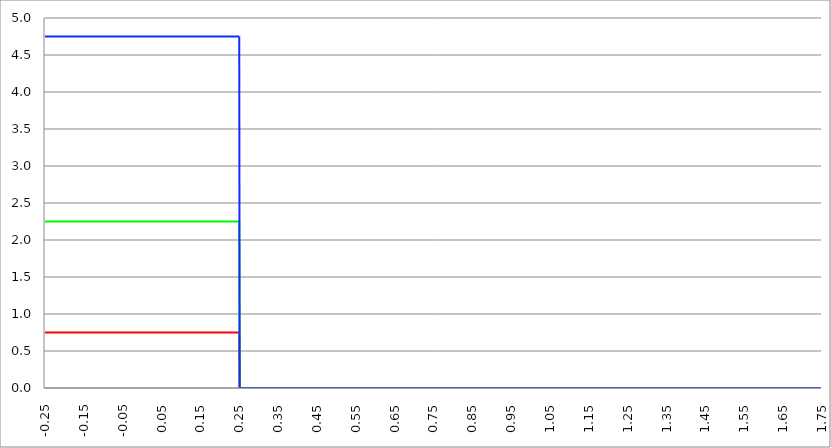
| Category | Series 1 | Series 0 | Series 2 |
|---|---|---|---|
| -0.25 | 0.75 | 2.25 | 4.75 |
| -0.249 | 0.75 | 2.25 | 4.75 |
| -0.248 | 0.75 | 2.25 | 4.75 |
| -0.247 | 0.75 | 2.25 | 4.75 |
| -0.246 | 0.75 | 2.25 | 4.75 |
| -0.245 | 0.75 | 2.25 | 4.75 |
| -0.244 | 0.75 | 2.25 | 4.75 |
| -0.243 | 0.75 | 2.25 | 4.75 |
| -0.242 | 0.75 | 2.25 | 4.75 |
| -0.241 | 0.75 | 2.25 | 4.75 |
| -0.24 | 0.75 | 2.25 | 4.75 |
| -0.239 | 0.75 | 2.25 | 4.75 |
| -0.238 | 0.75 | 2.25 | 4.75 |
| -0.237 | 0.75 | 2.25 | 4.75 |
| -0.236 | 0.75 | 2.25 | 4.75 |
| -0.235 | 0.75 | 2.25 | 4.75 |
| -0.234 | 0.75 | 2.25 | 4.75 |
| -0.233 | 0.75 | 2.25 | 4.75 |
| -0.232 | 0.75 | 2.25 | 4.75 |
| -0.231 | 0.75 | 2.25 | 4.75 |
| -0.23 | 0.75 | 2.25 | 4.75 |
| -0.229 | 0.75 | 2.25 | 4.75 |
| -0.228 | 0.75 | 2.25 | 4.75 |
| -0.227 | 0.75 | 2.25 | 4.75 |
| -0.226 | 0.75 | 2.25 | 4.75 |
| -0.225 | 0.75 | 2.25 | 4.75 |
| -0.224 | 0.75 | 2.25 | 4.75 |
| -0.223 | 0.75 | 2.25 | 4.75 |
| -0.222 | 0.75 | 2.25 | 4.75 |
| -0.221 | 0.75 | 2.25 | 4.75 |
| -0.22 | 0.75 | 2.25 | 4.75 |
| -0.219 | 0.75 | 2.25 | 4.75 |
| -0.218 | 0.75 | 2.25 | 4.75 |
| -0.217 | 0.75 | 2.25 | 4.75 |
| -0.216 | 0.75 | 2.25 | 4.75 |
| -0.215 | 0.75 | 2.25 | 4.75 |
| -0.214 | 0.75 | 2.25 | 4.75 |
| -0.213 | 0.75 | 2.25 | 4.75 |
| -0.212 | 0.75 | 2.25 | 4.75 |
| -0.211 | 0.75 | 2.25 | 4.75 |
| -0.21 | 0.75 | 2.25 | 4.75 |
| -0.209 | 0.75 | 2.25 | 4.75 |
| -0.208 | 0.75 | 2.25 | 4.75 |
| -0.207 | 0.75 | 2.25 | 4.75 |
| -0.206 | 0.75 | 2.25 | 4.75 |
| -0.205 | 0.75 | 2.25 | 4.75 |
| -0.204 | 0.75 | 2.25 | 4.75 |
| -0.203 | 0.75 | 2.25 | 4.75 |
| -0.202 | 0.75 | 2.25 | 4.75 |
| -0.201 | 0.75 | 2.25 | 4.75 |
| -0.2 | 0.75 | 2.25 | 4.75 |
| -0.199 | 0.75 | 2.25 | 4.75 |
| -0.198 | 0.75 | 2.25 | 4.75 |
| -0.197 | 0.75 | 2.25 | 4.75 |
| -0.196 | 0.75 | 2.25 | 4.75 |
| -0.195 | 0.75 | 2.25 | 4.75 |
| -0.194 | 0.75 | 2.25 | 4.75 |
| -0.193 | 0.75 | 2.25 | 4.75 |
| -0.192 | 0.75 | 2.25 | 4.75 |
| -0.191 | 0.75 | 2.25 | 4.75 |
| -0.19 | 0.75 | 2.25 | 4.75 |
| -0.189 | 0.75 | 2.25 | 4.75 |
| -0.188 | 0.75 | 2.25 | 4.75 |
| -0.187 | 0.75 | 2.25 | 4.75 |
| -0.186 | 0.75 | 2.25 | 4.75 |
| -0.185 | 0.75 | 2.25 | 4.75 |
| -0.184 | 0.75 | 2.25 | 4.75 |
| -0.183 | 0.75 | 2.25 | 4.75 |
| -0.182 | 0.75 | 2.25 | 4.75 |
| -0.181 | 0.75 | 2.25 | 4.75 |
| -0.18 | 0.75 | 2.25 | 4.75 |
| -0.179 | 0.75 | 2.25 | 4.75 |
| -0.178 | 0.75 | 2.25 | 4.75 |
| -0.177 | 0.75 | 2.25 | 4.75 |
| -0.176 | 0.75 | 2.25 | 4.75 |
| -0.175 | 0.75 | 2.25 | 4.75 |
| -0.174 | 0.75 | 2.25 | 4.75 |
| -0.173 | 0.75 | 2.25 | 4.75 |
| -0.172 | 0.75 | 2.25 | 4.75 |
| -0.171 | 0.75 | 2.25 | 4.75 |
| -0.17 | 0.75 | 2.25 | 4.75 |
| -0.169 | 0.75 | 2.25 | 4.75 |
| -0.168 | 0.75 | 2.25 | 4.75 |
| -0.167 | 0.75 | 2.25 | 4.75 |
| -0.166 | 0.75 | 2.25 | 4.75 |
| -0.165 | 0.75 | 2.25 | 4.75 |
| -0.164 | 0.75 | 2.25 | 4.75 |
| -0.163 | 0.75 | 2.25 | 4.75 |
| -0.162 | 0.75 | 2.25 | 4.75 |
| -0.161 | 0.75 | 2.25 | 4.75 |
| -0.16 | 0.75 | 2.25 | 4.75 |
| -0.159 | 0.75 | 2.25 | 4.75 |
| -0.158 | 0.75 | 2.25 | 4.75 |
| -0.157 | 0.75 | 2.25 | 4.75 |
| -0.156 | 0.75 | 2.25 | 4.75 |
| -0.155 | 0.75 | 2.25 | 4.75 |
| -0.154 | 0.75 | 2.25 | 4.75 |
| -0.153 | 0.75 | 2.25 | 4.75 |
| -0.152 | 0.75 | 2.25 | 4.75 |
| -0.151 | 0.75 | 2.25 | 4.75 |
| -0.15 | 0.75 | 2.25 | 4.75 |
| -0.149 | 0.75 | 2.25 | 4.75 |
| -0.148 | 0.75 | 2.25 | 4.75 |
| -0.147 | 0.75 | 2.25 | 4.75 |
| -0.146 | 0.75 | 2.25 | 4.75 |
| -0.145 | 0.75 | 2.25 | 4.75 |
| -0.144 | 0.75 | 2.25 | 4.75 |
| -0.143 | 0.75 | 2.25 | 4.75 |
| -0.142 | 0.75 | 2.25 | 4.75 |
| -0.141 | 0.75 | 2.25 | 4.75 |
| -0.14 | 0.75 | 2.25 | 4.75 |
| -0.139 | 0.75 | 2.25 | 4.75 |
| -0.138 | 0.75 | 2.25 | 4.75 |
| -0.137 | 0.75 | 2.25 | 4.75 |
| -0.136 | 0.75 | 2.25 | 4.75 |
| -0.135 | 0.75 | 2.25 | 4.75 |
| -0.134 | 0.75 | 2.25 | 4.75 |
| -0.133 | 0.75 | 2.25 | 4.75 |
| -0.132 | 0.75 | 2.25 | 4.75 |
| -0.131 | 0.75 | 2.25 | 4.75 |
| -0.13 | 0.75 | 2.25 | 4.75 |
| -0.129 | 0.75 | 2.25 | 4.75 |
| -0.128 | 0.75 | 2.25 | 4.75 |
| -0.127 | 0.75 | 2.25 | 4.75 |
| -0.126 | 0.75 | 2.25 | 4.75 |
| -0.125 | 0.75 | 2.25 | 4.75 |
| -0.124 | 0.75 | 2.25 | 4.75 |
| -0.123 | 0.75 | 2.25 | 4.75 |
| -0.122 | 0.75 | 2.25 | 4.75 |
| -0.121 | 0.75 | 2.25 | 4.75 |
| -0.12 | 0.75 | 2.25 | 4.75 |
| -0.119 | 0.75 | 2.25 | 4.75 |
| -0.118 | 0.75 | 2.25 | 4.75 |
| -0.117 | 0.75 | 2.25 | 4.75 |
| -0.116 | 0.75 | 2.25 | 4.75 |
| -0.115 | 0.75 | 2.25 | 4.75 |
| -0.114 | 0.75 | 2.25 | 4.75 |
| -0.113 | 0.75 | 2.25 | 4.75 |
| -0.112 | 0.75 | 2.25 | 4.75 |
| -0.111 | 0.75 | 2.25 | 4.75 |
| -0.11 | 0.75 | 2.25 | 4.75 |
| -0.109 | 0.75 | 2.25 | 4.75 |
| -0.108 | 0.75 | 2.25 | 4.75 |
| -0.107 | 0.75 | 2.25 | 4.75 |
| -0.106 | 0.75 | 2.25 | 4.75 |
| -0.105 | 0.75 | 2.25 | 4.75 |
| -0.104 | 0.75 | 2.25 | 4.75 |
| -0.103 | 0.75 | 2.25 | 4.75 |
| -0.102 | 0.75 | 2.25 | 4.75 |
| -0.101 | 0.75 | 2.25 | 4.75 |
| -0.0999999999999998 | 0.75 | 2.25 | 4.75 |
| -0.0989999999999998 | 0.75 | 2.25 | 4.75 |
| -0.0979999999999998 | 0.75 | 2.25 | 4.75 |
| -0.0969999999999998 | 0.75 | 2.25 | 4.75 |
| -0.0959999999999998 | 0.75 | 2.25 | 4.75 |
| -0.0949999999999998 | 0.75 | 2.25 | 4.75 |
| -0.0939999999999998 | 0.75 | 2.25 | 4.75 |
| -0.0929999999999998 | 0.75 | 2.25 | 4.75 |
| -0.0919999999999998 | 0.75 | 2.25 | 4.75 |
| -0.0909999999999998 | 0.75 | 2.25 | 4.75 |
| -0.0899999999999998 | 0.75 | 2.25 | 4.75 |
| -0.0889999999999998 | 0.75 | 2.25 | 4.75 |
| -0.0879999999999998 | 0.75 | 2.25 | 4.75 |
| -0.0869999999999998 | 0.75 | 2.25 | 4.75 |
| -0.0859999999999998 | 0.75 | 2.25 | 4.75 |
| -0.0849999999999998 | 0.75 | 2.25 | 4.75 |
| -0.0839999999999998 | 0.75 | 2.25 | 4.75 |
| -0.0829999999999998 | 0.75 | 2.25 | 4.75 |
| -0.0819999999999998 | 0.75 | 2.25 | 4.75 |
| -0.0809999999999998 | 0.75 | 2.25 | 4.75 |
| -0.0799999999999998 | 0.75 | 2.25 | 4.75 |
| -0.0789999999999998 | 0.75 | 2.25 | 4.75 |
| -0.0779999999999998 | 0.75 | 2.25 | 4.75 |
| -0.0769999999999998 | 0.75 | 2.25 | 4.75 |
| -0.0759999999999998 | 0.75 | 2.25 | 4.75 |
| -0.0749999999999998 | 0.75 | 2.25 | 4.75 |
| -0.0739999999999998 | 0.75 | 2.25 | 4.75 |
| -0.0729999999999998 | 0.75 | 2.25 | 4.75 |
| -0.0719999999999998 | 0.75 | 2.25 | 4.75 |
| -0.0709999999999998 | 0.75 | 2.25 | 4.75 |
| -0.0699999999999998 | 0.75 | 2.25 | 4.75 |
| -0.0689999999999998 | 0.75 | 2.25 | 4.75 |
| -0.0679999999999998 | 0.75 | 2.25 | 4.75 |
| -0.0669999999999998 | 0.75 | 2.25 | 4.75 |
| -0.0659999999999998 | 0.75 | 2.25 | 4.75 |
| -0.0649999999999998 | 0.75 | 2.25 | 4.75 |
| -0.0639999999999998 | 0.75 | 2.25 | 4.75 |
| -0.0629999999999998 | 0.75 | 2.25 | 4.75 |
| -0.0619999999999998 | 0.75 | 2.25 | 4.75 |
| -0.0609999999999998 | 0.75 | 2.25 | 4.75 |
| -0.0599999999999998 | 0.75 | 2.25 | 4.75 |
| -0.0589999999999998 | 0.75 | 2.25 | 4.75 |
| -0.0579999999999998 | 0.75 | 2.25 | 4.75 |
| -0.0569999999999998 | 0.75 | 2.25 | 4.75 |
| -0.0559999999999998 | 0.75 | 2.25 | 4.75 |
| -0.0549999999999998 | 0.75 | 2.25 | 4.75 |
| -0.0539999999999998 | 0.75 | 2.25 | 4.75 |
| -0.0529999999999998 | 0.75 | 2.25 | 4.75 |
| -0.0519999999999998 | 0.75 | 2.25 | 4.75 |
| -0.0509999999999998 | 0.75 | 2.25 | 4.75 |
| -0.0499999999999998 | 0.75 | 2.25 | 4.75 |
| -0.0489999999999998 | 0.75 | 2.25 | 4.75 |
| -0.0479999999999998 | 0.75 | 2.25 | 4.75 |
| -0.0469999999999998 | 0.75 | 2.25 | 4.75 |
| -0.0459999999999998 | 0.75 | 2.25 | 4.75 |
| -0.0449999999999998 | 0.75 | 2.25 | 4.75 |
| -0.0439999999999998 | 0.75 | 2.25 | 4.75 |
| -0.0429999999999998 | 0.75 | 2.25 | 4.75 |
| -0.0419999999999998 | 0.75 | 2.25 | 4.75 |
| -0.0409999999999998 | 0.75 | 2.25 | 4.75 |
| -0.0399999999999998 | 0.75 | 2.25 | 4.75 |
| -0.0389999999999998 | 0.75 | 2.25 | 4.75 |
| -0.0379999999999998 | 0.75 | 2.25 | 4.75 |
| -0.0369999999999998 | 0.75 | 2.25 | 4.75 |
| -0.0359999999999998 | 0.75 | 2.25 | 4.75 |
| -0.0349999999999998 | 0.75 | 2.25 | 4.75 |
| -0.0339999999999998 | 0.75 | 2.25 | 4.75 |
| -0.0329999999999998 | 0.75 | 2.25 | 4.75 |
| -0.0319999999999998 | 0.75 | 2.25 | 4.75 |
| -0.0309999999999998 | 0.75 | 2.25 | 4.75 |
| -0.0299999999999998 | 0.75 | 2.25 | 4.75 |
| -0.0289999999999998 | 0.75 | 2.25 | 4.75 |
| -0.0279999999999998 | 0.75 | 2.25 | 4.75 |
| -0.0269999999999998 | 0.75 | 2.25 | 4.75 |
| -0.0259999999999998 | 0.75 | 2.25 | 4.75 |
| -0.0249999999999998 | 0.75 | 2.25 | 4.75 |
| -0.0239999999999998 | 0.75 | 2.25 | 4.75 |
| -0.0229999999999998 | 0.75 | 2.25 | 4.75 |
| -0.0219999999999998 | 0.75 | 2.25 | 4.75 |
| -0.0209999999999998 | 0.75 | 2.25 | 4.75 |
| -0.0199999999999998 | 0.75 | 2.25 | 4.75 |
| -0.0189999999999998 | 0.75 | 2.25 | 4.75 |
| -0.0179999999999998 | 0.75 | 2.25 | 4.75 |
| -0.0169999999999998 | 0.75 | 2.25 | 4.75 |
| -0.0159999999999998 | 0.75 | 2.25 | 4.75 |
| -0.0149999999999998 | 0.75 | 2.25 | 4.75 |
| -0.0139999999999998 | 0.75 | 2.25 | 4.75 |
| -0.0129999999999998 | 0.75 | 2.25 | 4.75 |
| -0.0119999999999998 | 0.75 | 2.25 | 4.75 |
| -0.0109999999999998 | 0.75 | 2.25 | 4.75 |
| -0.00999999999999978 | 0.75 | 2.25 | 4.75 |
| -0.00899999999999978 | 0.75 | 2.25 | 4.75 |
| -0.00799999999999978 | 0.75 | 2.25 | 4.75 |
| -0.00699999999999978 | 0.75 | 2.25 | 4.75 |
| -0.00599999999999978 | 0.75 | 2.25 | 4.75 |
| -0.00499999999999978 | 0.75 | 2.25 | 4.75 |
| -0.00399999999999978 | 0.75 | 2.25 | 4.75 |
| -0.00299999999999978 | 0.75 | 2.25 | 4.75 |
| -0.00199999999999978 | 0.75 | 2.25 | 4.75 |
| -0.000999999999999785 | 0.75 | 2.25 | 4.75 |
| 2.15105711021124e-16 | 0.75 | 2.25 | 4.75 |
| 0.00100000000000021 | 0.75 | 2.25 | 4.75 |
| 0.00200000000000021 | 0.75 | 2.25 | 4.75 |
| 0.00300000000000021 | 0.75 | 2.25 | 4.75 |
| 0.00400000000000021 | 0.75 | 2.25 | 4.75 |
| 0.00500000000000021 | 0.75 | 2.25 | 4.75 |
| 0.00600000000000021 | 0.75 | 2.25 | 4.75 |
| 0.00700000000000021 | 0.75 | 2.25 | 4.75 |
| 0.00800000000000021 | 0.75 | 2.25 | 4.75 |
| 0.00900000000000021 | 0.75 | 2.25 | 4.75 |
| 0.0100000000000002 | 0.75 | 2.25 | 4.75 |
| 0.0110000000000002 | 0.75 | 2.25 | 4.75 |
| 0.0120000000000002 | 0.75 | 2.25 | 4.75 |
| 0.0130000000000002 | 0.75 | 2.25 | 4.75 |
| 0.0140000000000002 | 0.75 | 2.25 | 4.75 |
| 0.0150000000000002 | 0.75 | 2.25 | 4.75 |
| 0.0160000000000002 | 0.75 | 2.25 | 4.75 |
| 0.0170000000000002 | 0.75 | 2.25 | 4.75 |
| 0.0180000000000002 | 0.75 | 2.25 | 4.75 |
| 0.0190000000000002 | 0.75 | 2.25 | 4.75 |
| 0.0200000000000002 | 0.75 | 2.25 | 4.75 |
| 0.0210000000000002 | 0.75 | 2.25 | 4.75 |
| 0.0220000000000002 | 0.75 | 2.25 | 4.75 |
| 0.0230000000000002 | 0.75 | 2.25 | 4.75 |
| 0.0240000000000002 | 0.75 | 2.25 | 4.75 |
| 0.0250000000000002 | 0.75 | 2.25 | 4.75 |
| 0.0260000000000002 | 0.75 | 2.25 | 4.75 |
| 0.0270000000000002 | 0.75 | 2.25 | 4.75 |
| 0.0280000000000002 | 0.75 | 2.25 | 4.75 |
| 0.0290000000000002 | 0.75 | 2.25 | 4.75 |
| 0.0300000000000002 | 0.75 | 2.25 | 4.75 |
| 0.0310000000000002 | 0.75 | 2.25 | 4.75 |
| 0.0320000000000002 | 0.75 | 2.25 | 4.75 |
| 0.0330000000000002 | 0.75 | 2.25 | 4.75 |
| 0.0340000000000002 | 0.75 | 2.25 | 4.75 |
| 0.0350000000000002 | 0.75 | 2.25 | 4.75 |
| 0.0360000000000002 | 0.75 | 2.25 | 4.75 |
| 0.0370000000000002 | 0.75 | 2.25 | 4.75 |
| 0.0380000000000002 | 0.75 | 2.25 | 4.75 |
| 0.0390000000000002 | 0.75 | 2.25 | 4.75 |
| 0.0400000000000002 | 0.75 | 2.25 | 4.75 |
| 0.0410000000000002 | 0.75 | 2.25 | 4.75 |
| 0.0420000000000002 | 0.75 | 2.25 | 4.75 |
| 0.0430000000000002 | 0.75 | 2.25 | 4.75 |
| 0.0440000000000002 | 0.75 | 2.25 | 4.75 |
| 0.0450000000000002 | 0.75 | 2.25 | 4.75 |
| 0.0460000000000002 | 0.75 | 2.25 | 4.75 |
| 0.0470000000000002 | 0.75 | 2.25 | 4.75 |
| 0.0480000000000002 | 0.75 | 2.25 | 4.75 |
| 0.0490000000000002 | 0.75 | 2.25 | 4.75 |
| 0.0500000000000002 | 0.75 | 2.25 | 4.75 |
| 0.0510000000000002 | 0.75 | 2.25 | 4.75 |
| 0.0520000000000002 | 0.75 | 2.25 | 4.75 |
| 0.0530000000000002 | 0.75 | 2.25 | 4.75 |
| 0.0540000000000002 | 0.75 | 2.25 | 4.75 |
| 0.0550000000000002 | 0.75 | 2.25 | 4.75 |
| 0.0560000000000002 | 0.75 | 2.25 | 4.75 |
| 0.0570000000000002 | 0.75 | 2.25 | 4.75 |
| 0.0580000000000002 | 0.75 | 2.25 | 4.75 |
| 0.0590000000000002 | 0.75 | 2.25 | 4.75 |
| 0.0600000000000002 | 0.75 | 2.25 | 4.75 |
| 0.0610000000000003 | 0.75 | 2.25 | 4.75 |
| 0.0620000000000003 | 0.75 | 2.25 | 4.75 |
| 0.0630000000000003 | 0.75 | 2.25 | 4.75 |
| 0.0640000000000003 | 0.75 | 2.25 | 4.75 |
| 0.0650000000000003 | 0.75 | 2.25 | 4.75 |
| 0.0660000000000003 | 0.75 | 2.25 | 4.75 |
| 0.0670000000000003 | 0.75 | 2.25 | 4.75 |
| 0.0680000000000003 | 0.75 | 2.25 | 4.75 |
| 0.0690000000000003 | 0.75 | 2.25 | 4.75 |
| 0.0700000000000003 | 0.75 | 2.25 | 4.75 |
| 0.0710000000000003 | 0.75 | 2.25 | 4.75 |
| 0.0720000000000003 | 0.75 | 2.25 | 4.75 |
| 0.0730000000000003 | 0.75 | 2.25 | 4.75 |
| 0.0740000000000003 | 0.75 | 2.25 | 4.75 |
| 0.0750000000000003 | 0.75 | 2.25 | 4.75 |
| 0.0760000000000003 | 0.75 | 2.25 | 4.75 |
| 0.0770000000000003 | 0.75 | 2.25 | 4.75 |
| 0.0780000000000003 | 0.75 | 2.25 | 4.75 |
| 0.0790000000000003 | 0.75 | 2.25 | 4.75 |
| 0.0800000000000003 | 0.75 | 2.25 | 4.75 |
| 0.0810000000000003 | 0.75 | 2.25 | 4.75 |
| 0.0820000000000003 | 0.75 | 2.25 | 4.75 |
| 0.0830000000000003 | 0.75 | 2.25 | 4.75 |
| 0.0840000000000003 | 0.75 | 2.25 | 4.75 |
| 0.0850000000000003 | 0.75 | 2.25 | 4.75 |
| 0.0860000000000003 | 0.75 | 2.25 | 4.75 |
| 0.0870000000000003 | 0.75 | 2.25 | 4.75 |
| 0.0880000000000003 | 0.75 | 2.25 | 4.75 |
| 0.0890000000000003 | 0.75 | 2.25 | 4.75 |
| 0.0900000000000003 | 0.75 | 2.25 | 4.75 |
| 0.0910000000000003 | 0.75 | 2.25 | 4.75 |
| 0.0920000000000003 | 0.75 | 2.25 | 4.75 |
| 0.0930000000000003 | 0.75 | 2.25 | 4.75 |
| 0.0940000000000003 | 0.75 | 2.25 | 4.75 |
| 0.0950000000000003 | 0.75 | 2.25 | 4.75 |
| 0.0960000000000003 | 0.75 | 2.25 | 4.75 |
| 0.0970000000000003 | 0.75 | 2.25 | 4.75 |
| 0.0980000000000003 | 0.75 | 2.25 | 4.75 |
| 0.0990000000000003 | 0.75 | 2.25 | 4.75 |
| 0.1 | 0.75 | 2.25 | 4.75 |
| 0.101 | 0.75 | 2.25 | 4.75 |
| 0.102 | 0.75 | 2.25 | 4.75 |
| 0.103 | 0.75 | 2.25 | 4.75 |
| 0.104 | 0.75 | 2.25 | 4.75 |
| 0.105 | 0.75 | 2.25 | 4.75 |
| 0.106 | 0.75 | 2.25 | 4.75 |
| 0.107 | 0.75 | 2.25 | 4.75 |
| 0.108 | 0.75 | 2.25 | 4.75 |
| 0.109 | 0.75 | 2.25 | 4.75 |
| 0.11 | 0.75 | 2.25 | 4.75 |
| 0.111 | 0.75 | 2.25 | 4.75 |
| 0.112 | 0.75 | 2.25 | 4.75 |
| 0.113 | 0.75 | 2.25 | 4.75 |
| 0.114 | 0.75 | 2.25 | 4.75 |
| 0.115 | 0.75 | 2.25 | 4.75 |
| 0.116 | 0.75 | 2.25 | 4.75 |
| 0.117 | 0.75 | 2.25 | 4.75 |
| 0.118 | 0.75 | 2.25 | 4.75 |
| 0.119 | 0.75 | 2.25 | 4.75 |
| 0.12 | 0.75 | 2.25 | 4.75 |
| 0.121 | 0.75 | 2.25 | 4.75 |
| 0.122 | 0.75 | 2.25 | 4.75 |
| 0.123 | 0.75 | 2.25 | 4.75 |
| 0.124 | 0.75 | 2.25 | 4.75 |
| 0.125 | 0.75 | 2.25 | 4.75 |
| 0.126 | 0.75 | 2.25 | 4.75 |
| 0.127 | 0.75 | 2.25 | 4.75 |
| 0.128 | 0.75 | 2.25 | 4.75 |
| 0.129 | 0.75 | 2.25 | 4.75 |
| 0.13 | 0.75 | 2.25 | 4.75 |
| 0.131 | 0.75 | 2.25 | 4.75 |
| 0.132 | 0.75 | 2.25 | 4.75 |
| 0.133 | 0.75 | 2.25 | 4.75 |
| 0.134 | 0.75 | 2.25 | 4.75 |
| 0.135 | 0.75 | 2.25 | 4.75 |
| 0.136 | 0.75 | 2.25 | 4.75 |
| 0.137 | 0.75 | 2.25 | 4.75 |
| 0.138 | 0.75 | 2.25 | 4.75 |
| 0.139 | 0.75 | 2.25 | 4.75 |
| 0.14 | 0.75 | 2.25 | 4.75 |
| 0.141 | 0.75 | 2.25 | 4.75 |
| 0.142 | 0.75 | 2.25 | 4.75 |
| 0.143 | 0.75 | 2.25 | 4.75 |
| 0.144 | 0.75 | 2.25 | 4.75 |
| 0.145 | 0.75 | 2.25 | 4.75 |
| 0.146 | 0.75 | 2.25 | 4.75 |
| 0.147 | 0.75 | 2.25 | 4.75 |
| 0.148 | 0.75 | 2.25 | 4.75 |
| 0.149 | 0.75 | 2.25 | 4.75 |
| 0.15 | 0.75 | 2.25 | 4.75 |
| 0.151 | 0.75 | 2.25 | 4.75 |
| 0.152 | 0.75 | 2.25 | 4.75 |
| 0.153 | 0.75 | 2.25 | 4.75 |
| 0.154 | 0.75 | 2.25 | 4.75 |
| 0.155 | 0.75 | 2.25 | 4.75 |
| 0.156 | 0.75 | 2.25 | 4.75 |
| 0.157 | 0.75 | 2.25 | 4.75 |
| 0.158 | 0.75 | 2.25 | 4.75 |
| 0.159 | 0.75 | 2.25 | 4.75 |
| 0.16 | 0.75 | 2.25 | 4.75 |
| 0.161 | 0.75 | 2.25 | 4.75 |
| 0.162 | 0.75 | 2.25 | 4.75 |
| 0.163 | 0.75 | 2.25 | 4.75 |
| 0.164 | 0.75 | 2.25 | 4.75 |
| 0.165 | 0.75 | 2.25 | 4.75 |
| 0.166 | 0.75 | 2.25 | 4.75 |
| 0.167 | 0.75 | 2.25 | 4.75 |
| 0.168 | 0.75 | 2.25 | 4.75 |
| 0.169 | 0.75 | 2.25 | 4.75 |
| 0.17 | 0.75 | 2.25 | 4.75 |
| 0.171 | 0.75 | 2.25 | 4.75 |
| 0.172 | 0.75 | 2.25 | 4.75 |
| 0.173 | 0.75 | 2.25 | 4.75 |
| 0.174 | 0.75 | 2.25 | 4.75 |
| 0.175 | 0.75 | 2.25 | 4.75 |
| 0.176 | 0.75 | 2.25 | 4.75 |
| 0.177 | 0.75 | 2.25 | 4.75 |
| 0.178 | 0.75 | 2.25 | 4.75 |
| 0.179 | 0.75 | 2.25 | 4.75 |
| 0.18 | 0.75 | 2.25 | 4.75 |
| 0.181 | 0.75 | 2.25 | 4.75 |
| 0.182 | 0.75 | 2.25 | 4.75 |
| 0.183 | 0.75 | 2.25 | 4.75 |
| 0.184 | 0.75 | 2.25 | 4.75 |
| 0.185 | 0.75 | 2.25 | 4.75 |
| 0.186 | 0.75 | 2.25 | 4.75 |
| 0.187 | 0.75 | 2.25 | 4.75 |
| 0.188 | 0.75 | 2.25 | 4.75 |
| 0.189 | 0.75 | 2.25 | 4.75 |
| 0.19 | 0.75 | 2.25 | 4.75 |
| 0.191 | 0.75 | 2.25 | 4.75 |
| 0.192 | 0.75 | 2.25 | 4.75 |
| 0.193 | 0.75 | 2.25 | 4.75 |
| 0.194 | 0.75 | 2.25 | 4.75 |
| 0.195 | 0.75 | 2.25 | 4.75 |
| 0.196 | 0.75 | 2.25 | 4.75 |
| 0.197 | 0.75 | 2.25 | 4.75 |
| 0.198 | 0.75 | 2.25 | 4.75 |
| 0.199 | 0.75 | 2.25 | 4.75 |
| 0.2 | 0.75 | 2.25 | 4.75 |
| 0.201 | 0.75 | 2.25 | 4.75 |
| 0.202 | 0.75 | 2.25 | 4.75 |
| 0.203 | 0.75 | 2.25 | 4.75 |
| 0.204 | 0.75 | 2.25 | 4.75 |
| 0.205 | 0.75 | 2.25 | 4.75 |
| 0.206 | 0.75 | 2.25 | 4.75 |
| 0.207 | 0.75 | 2.25 | 4.75 |
| 0.208 | 0.75 | 2.25 | 4.75 |
| 0.209 | 0.75 | 2.25 | 4.75 |
| 0.21 | 0.75 | 2.25 | 4.75 |
| 0.211 | 0.75 | 2.25 | 4.75 |
| 0.212 | 0.75 | 2.25 | 4.75 |
| 0.213 | 0.75 | 2.25 | 4.75 |
| 0.214 | 0.75 | 2.25 | 4.75 |
| 0.215 | 0.75 | 2.25 | 4.75 |
| 0.216 | 0.75 | 2.25 | 4.75 |
| 0.217 | 0.75 | 2.25 | 4.75 |
| 0.218 | 0.75 | 2.25 | 4.75 |
| 0.219 | 0.75 | 2.25 | 4.75 |
| 0.22 | 0.75 | 2.25 | 4.75 |
| 0.221 | 0.75 | 2.25 | 4.75 |
| 0.222 | 0.75 | 2.25 | 4.75 |
| 0.223 | 0.75 | 2.25 | 4.75 |
| 0.224 | 0.75 | 2.25 | 4.75 |
| 0.225 | 0.75 | 2.25 | 4.75 |
| 0.226 | 0.75 | 2.25 | 4.75 |
| 0.227 | 0.75 | 2.25 | 4.75 |
| 0.228 | 0.75 | 2.25 | 4.75 |
| 0.229 | 0.75 | 2.25 | 4.75 |
| 0.23 | 0.75 | 2.25 | 4.75 |
| 0.231 | 0.75 | 2.25 | 4.75 |
| 0.232 | 0.75 | 2.25 | 4.75 |
| 0.233 | 0.75 | 2.25 | 4.75 |
| 0.234 | 0.75 | 2.25 | 4.75 |
| 0.235 | 0.75 | 2.25 | 4.75 |
| 0.236 | 0.75 | 2.25 | 4.75 |
| 0.237 | 0.75 | 2.25 | 4.75 |
| 0.238 | 0.75 | 2.25 | 4.75 |
| 0.239 | 0.75 | 2.25 | 4.75 |
| 0.24 | 0.75 | 2.25 | 4.75 |
| 0.241 | 0.75 | 2.25 | 4.75 |
| 0.242 | 0.75 | 2.25 | 4.75 |
| 0.243 | 0.75 | 2.25 | 4.75 |
| 0.244 | 0.75 | 2.25 | 4.75 |
| 0.245 | 0.75 | 2.25 | 4.75 |
| 0.246 | 0.75 | 2.25 | 4.75 |
| 0.247 | 0.75 | 2.25 | 4.75 |
| 0.248 | 0.75 | 2.25 | 4.75 |
| 0.249 | 0.75 | 2.25 | 4.75 |
| 0.25 | 0.75 | 2.25 | 4.75 |
| 0.251 | 0 | 0 | 0 |
| 0.252 | 0 | 0 | 0 |
| 0.253 | 0 | 0 | 0 |
| 0.254 | 0 | 0 | 0 |
| 0.255 | 0 | 0 | 0 |
| 0.256 | 0 | 0 | 0 |
| 0.257 | 0 | 0 | 0 |
| 0.258 | 0 | 0 | 0 |
| 0.259 | 0 | 0 | 0 |
| 0.26 | 0 | 0 | 0 |
| 0.261 | 0 | 0 | 0 |
| 0.262 | 0 | 0 | 0 |
| 0.263 | 0 | 0 | 0 |
| 0.264 | 0 | 0 | 0 |
| 0.265 | 0 | 0 | 0 |
| 0.266 | 0 | 0 | 0 |
| 0.267 | 0 | 0 | 0 |
| 0.268 | 0 | 0 | 0 |
| 0.269 | 0 | 0 | 0 |
| 0.27 | 0 | 0 | 0 |
| 0.271 | 0 | 0 | 0 |
| 0.272 | 0 | 0 | 0 |
| 0.273 | 0 | 0 | 0 |
| 0.274 | 0 | 0 | 0 |
| 0.275 | 0 | 0 | 0 |
| 0.276 | 0 | 0 | 0 |
| 0.277 | 0 | 0 | 0 |
| 0.278 | 0 | 0 | 0 |
| 0.279 | 0 | 0 | 0 |
| 0.28 | 0 | 0 | 0 |
| 0.281 | 0 | 0 | 0 |
| 0.282 | 0 | 0 | 0 |
| 0.283 | 0 | 0 | 0 |
| 0.284 | 0 | 0 | 0 |
| 0.285 | 0 | 0 | 0 |
| 0.286 | 0 | 0 | 0 |
| 0.287 | 0 | 0 | 0 |
| 0.288 | 0 | 0 | 0 |
| 0.289 | 0 | 0 | 0 |
| 0.29 | 0 | 0 | 0 |
| 0.291 | 0 | 0 | 0 |
| 0.292 | 0 | 0 | 0 |
| 0.293 | 0 | 0 | 0 |
| 0.294 | 0 | 0 | 0 |
| 0.295 | 0 | 0 | 0 |
| 0.296 | 0 | 0 | 0 |
| 0.297 | 0 | 0 | 0 |
| 0.298 | 0 | 0 | 0 |
| 0.299 | 0 | 0 | 0 |
| 0.3 | 0 | 0 | 0 |
| 0.301 | 0 | 0 | 0 |
| 0.302 | 0 | 0 | 0 |
| 0.303 | 0 | 0 | 0 |
| 0.304 | 0 | 0 | 0 |
| 0.305 | 0 | 0 | 0 |
| 0.306 | 0 | 0 | 0 |
| 0.307 | 0 | 0 | 0 |
| 0.308 | 0 | 0 | 0 |
| 0.309 | 0 | 0 | 0 |
| 0.31 | 0 | 0 | 0 |
| 0.311 | 0 | 0 | 0 |
| 0.312 | 0 | 0 | 0 |
| 0.313 | 0 | 0 | 0 |
| 0.314 | 0 | 0 | 0 |
| 0.315 | 0 | 0 | 0 |
| 0.316 | 0 | 0 | 0 |
| 0.317 | 0 | 0 | 0 |
| 0.318 | 0 | 0 | 0 |
| 0.319 | 0 | 0 | 0 |
| 0.32 | 0 | 0 | 0 |
| 0.321 | 0 | 0 | 0 |
| 0.322 | 0 | 0 | 0 |
| 0.323 | 0 | 0 | 0 |
| 0.324 | 0 | 0 | 0 |
| 0.325 | 0 | 0 | 0 |
| 0.326 | 0 | 0 | 0 |
| 0.327 | 0 | 0 | 0 |
| 0.328 | 0 | 0 | 0 |
| 0.329 | 0 | 0 | 0 |
| 0.33 | 0 | 0 | 0 |
| 0.331 | 0 | 0 | 0 |
| 0.332 | 0 | 0 | 0 |
| 0.333 | 0 | 0 | 0 |
| 0.334 | 0 | 0 | 0 |
| 0.335 | 0 | 0 | 0 |
| 0.336 | 0 | 0 | 0 |
| 0.337 | 0 | 0 | 0 |
| 0.338 | 0 | 0 | 0 |
| 0.339 | 0 | 0 | 0 |
| 0.34 | 0 | 0 | 0 |
| 0.341 | 0 | 0 | 0 |
| 0.342 | 0 | 0 | 0 |
| 0.343 | 0 | 0 | 0 |
| 0.344 | 0 | 0 | 0 |
| 0.345 | 0 | 0 | 0 |
| 0.346 | 0 | 0 | 0 |
| 0.347 | 0 | 0 | 0 |
| 0.348 | 0 | 0 | 0 |
| 0.349 | 0 | 0 | 0 |
| 0.35 | 0 | 0 | 0 |
| 0.351 | 0 | 0 | 0 |
| 0.352 | 0 | 0 | 0 |
| 0.353 | 0 | 0 | 0 |
| 0.354 | 0 | 0 | 0 |
| 0.355 | 0 | 0 | 0 |
| 0.356 | 0 | 0 | 0 |
| 0.357 | 0 | 0 | 0 |
| 0.358 | 0 | 0 | 0 |
| 0.359 | 0 | 0 | 0 |
| 0.36 | 0 | 0 | 0 |
| 0.361 | 0 | 0 | 0 |
| 0.362 | 0 | 0 | 0 |
| 0.363 | 0 | 0 | 0 |
| 0.364 | 0 | 0 | 0 |
| 0.365 | 0 | 0 | 0 |
| 0.366 | 0 | 0 | 0 |
| 0.367 | 0 | 0 | 0 |
| 0.368 | 0 | 0 | 0 |
| 0.369 | 0 | 0 | 0 |
| 0.37 | 0 | 0 | 0 |
| 0.371 | 0 | 0 | 0 |
| 0.372 | 0 | 0 | 0 |
| 0.373 | 0 | 0 | 0 |
| 0.374 | 0 | 0 | 0 |
| 0.375 | 0 | 0 | 0 |
| 0.376 | 0 | 0 | 0 |
| 0.377 | 0 | 0 | 0 |
| 0.378 | 0 | 0 | 0 |
| 0.379 | 0 | 0 | 0 |
| 0.38 | 0 | 0 | 0 |
| 0.381 | 0 | 0 | 0 |
| 0.382 | 0 | 0 | 0 |
| 0.383 | 0 | 0 | 0 |
| 0.384 | 0 | 0 | 0 |
| 0.385 | 0 | 0 | 0 |
| 0.386 | 0 | 0 | 0 |
| 0.387 | 0 | 0 | 0 |
| 0.388 | 0 | 0 | 0 |
| 0.389 | 0 | 0 | 0 |
| 0.39 | 0 | 0 | 0 |
| 0.391 | 0 | 0 | 0 |
| 0.392 | 0 | 0 | 0 |
| 0.393 | 0 | 0 | 0 |
| 0.394 | 0 | 0 | 0 |
| 0.395 | 0 | 0 | 0 |
| 0.396 | 0 | 0 | 0 |
| 0.397 | 0 | 0 | 0 |
| 0.398 | 0 | 0 | 0 |
| 0.399 | 0 | 0 | 0 |
| 0.4 | 0 | 0 | 0 |
| 0.401000000000001 | 0 | 0 | 0 |
| 0.402000000000001 | 0 | 0 | 0 |
| 0.403000000000001 | 0 | 0 | 0 |
| 0.404000000000001 | 0 | 0 | 0 |
| 0.405000000000001 | 0 | 0 | 0 |
| 0.406000000000001 | 0 | 0 | 0 |
| 0.407000000000001 | 0 | 0 | 0 |
| 0.408000000000001 | 0 | 0 | 0 |
| 0.409000000000001 | 0 | 0 | 0 |
| 0.410000000000001 | 0 | 0 | 0 |
| 0.411000000000001 | 0 | 0 | 0 |
| 0.412000000000001 | 0 | 0 | 0 |
| 0.413000000000001 | 0 | 0 | 0 |
| 0.414000000000001 | 0 | 0 | 0 |
| 0.415000000000001 | 0 | 0 | 0 |
| 0.416000000000001 | 0 | 0 | 0 |
| 0.417000000000001 | 0 | 0 | 0 |
| 0.418000000000001 | 0 | 0 | 0 |
| 0.419000000000001 | 0 | 0 | 0 |
| 0.420000000000001 | 0 | 0 | 0 |
| 0.421000000000001 | 0 | 0 | 0 |
| 0.422000000000001 | 0 | 0 | 0 |
| 0.423000000000001 | 0 | 0 | 0 |
| 0.424000000000001 | 0 | 0 | 0 |
| 0.425000000000001 | 0 | 0 | 0 |
| 0.426000000000001 | 0 | 0 | 0 |
| 0.427000000000001 | 0 | 0 | 0 |
| 0.428000000000001 | 0 | 0 | 0 |
| 0.429000000000001 | 0 | 0 | 0 |
| 0.430000000000001 | 0 | 0 | 0 |
| 0.431000000000001 | 0 | 0 | 0 |
| 0.432000000000001 | 0 | 0 | 0 |
| 0.433000000000001 | 0 | 0 | 0 |
| 0.434000000000001 | 0 | 0 | 0 |
| 0.435000000000001 | 0 | 0 | 0 |
| 0.436000000000001 | 0 | 0 | 0 |
| 0.437000000000001 | 0 | 0 | 0 |
| 0.438000000000001 | 0 | 0 | 0 |
| 0.439000000000001 | 0 | 0 | 0 |
| 0.440000000000001 | 0 | 0 | 0 |
| 0.441000000000001 | 0 | 0 | 0 |
| 0.442000000000001 | 0 | 0 | 0 |
| 0.443000000000001 | 0 | 0 | 0 |
| 0.444000000000001 | 0 | 0 | 0 |
| 0.445000000000001 | 0 | 0 | 0 |
| 0.446000000000001 | 0 | 0 | 0 |
| 0.447000000000001 | 0 | 0 | 0 |
| 0.448000000000001 | 0 | 0 | 0 |
| 0.449000000000001 | 0 | 0 | 0 |
| 0.450000000000001 | 0 | 0 | 0 |
| 0.451000000000001 | 0 | 0 | 0 |
| 0.452000000000001 | 0 | 0 | 0 |
| 0.453000000000001 | 0 | 0 | 0 |
| 0.454000000000001 | 0 | 0 | 0 |
| 0.455000000000001 | 0 | 0 | 0 |
| 0.456000000000001 | 0 | 0 | 0 |
| 0.457000000000001 | 0 | 0 | 0 |
| 0.458000000000001 | 0 | 0 | 0 |
| 0.459000000000001 | 0 | 0 | 0 |
| 0.460000000000001 | 0 | 0 | 0 |
| 0.461000000000001 | 0 | 0 | 0 |
| 0.462000000000001 | 0 | 0 | 0 |
| 0.463000000000001 | 0 | 0 | 0 |
| 0.464000000000001 | 0 | 0 | 0 |
| 0.465000000000001 | 0 | 0 | 0 |
| 0.466000000000001 | 0 | 0 | 0 |
| 0.467000000000001 | 0 | 0 | 0 |
| 0.468000000000001 | 0 | 0 | 0 |
| 0.469000000000001 | 0 | 0 | 0 |
| 0.470000000000001 | 0 | 0 | 0 |
| 0.471000000000001 | 0 | 0 | 0 |
| 0.472000000000001 | 0 | 0 | 0 |
| 0.473000000000001 | 0 | 0 | 0 |
| 0.474000000000001 | 0 | 0 | 0 |
| 0.475000000000001 | 0 | 0 | 0 |
| 0.476000000000001 | 0 | 0 | 0 |
| 0.477000000000001 | 0 | 0 | 0 |
| 0.478000000000001 | 0 | 0 | 0 |
| 0.479000000000001 | 0 | 0 | 0 |
| 0.480000000000001 | 0 | 0 | 0 |
| 0.481000000000001 | 0 | 0 | 0 |
| 0.482000000000001 | 0 | 0 | 0 |
| 0.483000000000001 | 0 | 0 | 0 |
| 0.484000000000001 | 0 | 0 | 0 |
| 0.485000000000001 | 0 | 0 | 0 |
| 0.486000000000001 | 0 | 0 | 0 |
| 0.487000000000001 | 0 | 0 | 0 |
| 0.488000000000001 | 0 | 0 | 0 |
| 0.489000000000001 | 0 | 0 | 0 |
| 0.490000000000001 | 0 | 0 | 0 |
| 0.491000000000001 | 0 | 0 | 0 |
| 0.492000000000001 | 0 | 0 | 0 |
| 0.493000000000001 | 0 | 0 | 0 |
| 0.494000000000001 | 0 | 0 | 0 |
| 0.495000000000001 | 0 | 0 | 0 |
| 0.496000000000001 | 0 | 0 | 0 |
| 0.497000000000001 | 0 | 0 | 0 |
| 0.498000000000001 | 0 | 0 | 0 |
| 0.499000000000001 | 0 | 0 | 0 |
| 0.500000000000001 | 0 | 0 | 0 |
| 0.501000000000001 | 0 | 0 | 0 |
| 0.502000000000001 | 0 | 0 | 0 |
| 0.503000000000001 | 0 | 0 | 0 |
| 0.504000000000001 | 0 | 0 | 0 |
| 0.505000000000001 | 0 | 0 | 0 |
| 0.506000000000001 | 0 | 0 | 0 |
| 0.507000000000001 | 0 | 0 | 0 |
| 0.508000000000001 | 0 | 0 | 0 |
| 0.509000000000001 | 0 | 0 | 0 |
| 0.510000000000001 | 0 | 0 | 0 |
| 0.511000000000001 | 0 | 0 | 0 |
| 0.512000000000001 | 0 | 0 | 0 |
| 0.513000000000001 | 0 | 0 | 0 |
| 0.514000000000001 | 0 | 0 | 0 |
| 0.515000000000001 | 0 | 0 | 0 |
| 0.516000000000001 | 0 | 0 | 0 |
| 0.517000000000001 | 0 | 0 | 0 |
| 0.518000000000001 | 0 | 0 | 0 |
| 0.519000000000001 | 0 | 0 | 0 |
| 0.520000000000001 | 0 | 0 | 0 |
| 0.521000000000001 | 0 | 0 | 0 |
| 0.522000000000001 | 0 | 0 | 0 |
| 0.523000000000001 | 0 | 0 | 0 |
| 0.524000000000001 | 0 | 0 | 0 |
| 0.525000000000001 | 0 | 0 | 0 |
| 0.526000000000001 | 0 | 0 | 0 |
| 0.527000000000001 | 0 | 0 | 0 |
| 0.528000000000001 | 0 | 0 | 0 |
| 0.529000000000001 | 0 | 0 | 0 |
| 0.530000000000001 | 0 | 0 | 0 |
| 0.531000000000001 | 0 | 0 | 0 |
| 0.532000000000001 | 0 | 0 | 0 |
| 0.533000000000001 | 0 | 0 | 0 |
| 0.534000000000001 | 0 | 0 | 0 |
| 0.535000000000001 | 0 | 0 | 0 |
| 0.536000000000001 | 0 | 0 | 0 |
| 0.537000000000001 | 0 | 0 | 0 |
| 0.538000000000001 | 0 | 0 | 0 |
| 0.539000000000001 | 0 | 0 | 0 |
| 0.540000000000001 | 0 | 0 | 0 |
| 0.541000000000001 | 0 | 0 | 0 |
| 0.542000000000001 | 0 | 0 | 0 |
| 0.543000000000001 | 0 | 0 | 0 |
| 0.544000000000001 | 0 | 0 | 0 |
| 0.545000000000001 | 0 | 0 | 0 |
| 0.546000000000001 | 0 | 0 | 0 |
| 0.547000000000001 | 0 | 0 | 0 |
| 0.548000000000001 | 0 | 0 | 0 |
| 0.549000000000001 | 0 | 0 | 0 |
| 0.550000000000001 | 0 | 0 | 0 |
| 0.551000000000001 | 0 | 0 | 0 |
| 0.552000000000001 | 0 | 0 | 0 |
| 0.553000000000001 | 0 | 0 | 0 |
| 0.554000000000001 | 0 | 0 | 0 |
| 0.555000000000001 | 0 | 0 | 0 |
| 0.556000000000001 | 0 | 0 | 0 |
| 0.557000000000001 | 0 | 0 | 0 |
| 0.558000000000001 | 0 | 0 | 0 |
| 0.559000000000001 | 0 | 0 | 0 |
| 0.560000000000001 | 0 | 0 | 0 |
| 0.561000000000001 | 0 | 0 | 0 |
| 0.562000000000001 | 0 | 0 | 0 |
| 0.563000000000001 | 0 | 0 | 0 |
| 0.564000000000001 | 0 | 0 | 0 |
| 0.565000000000001 | 0 | 0 | 0 |
| 0.566000000000001 | 0 | 0 | 0 |
| 0.567000000000001 | 0 | 0 | 0 |
| 0.568000000000001 | 0 | 0 | 0 |
| 0.569000000000001 | 0 | 0 | 0 |
| 0.570000000000001 | 0 | 0 | 0 |
| 0.571000000000001 | 0 | 0 | 0 |
| 0.572000000000001 | 0 | 0 | 0 |
| 0.573000000000001 | 0 | 0 | 0 |
| 0.574000000000001 | 0 | 0 | 0 |
| 0.575000000000001 | 0 | 0 | 0 |
| 0.576000000000001 | 0 | 0 | 0 |
| 0.577000000000001 | 0 | 0 | 0 |
| 0.578000000000001 | 0 | 0 | 0 |
| 0.579000000000001 | 0 | 0 | 0 |
| 0.580000000000001 | 0 | 0 | 0 |
| 0.581000000000001 | 0 | 0 | 0 |
| 0.582000000000001 | 0 | 0 | 0 |
| 0.583000000000001 | 0 | 0 | 0 |
| 0.584000000000001 | 0 | 0 | 0 |
| 0.585000000000001 | 0 | 0 | 0 |
| 0.586000000000001 | 0 | 0 | 0 |
| 0.587000000000001 | 0 | 0 | 0 |
| 0.588000000000001 | 0 | 0 | 0 |
| 0.589000000000001 | 0 | 0 | 0 |
| 0.590000000000001 | 0 | 0 | 0 |
| 0.591000000000001 | 0 | 0 | 0 |
| 0.592000000000001 | 0 | 0 | 0 |
| 0.593000000000001 | 0 | 0 | 0 |
| 0.594000000000001 | 0 | 0 | 0 |
| 0.595000000000001 | 0 | 0 | 0 |
| 0.596000000000001 | 0 | 0 | 0 |
| 0.597000000000001 | 0 | 0 | 0 |
| 0.598000000000001 | 0 | 0 | 0 |
| 0.599000000000001 | 0 | 0 | 0 |
| 0.600000000000001 | 0 | 0 | 0 |
| 0.601000000000001 | 0 | 0 | 0 |
| 0.602000000000001 | 0 | 0 | 0 |
| 0.603000000000001 | 0 | 0 | 0 |
| 0.604000000000001 | 0 | 0 | 0 |
| 0.605000000000001 | 0 | 0 | 0 |
| 0.606000000000001 | 0 | 0 | 0 |
| 0.607000000000001 | 0 | 0 | 0 |
| 0.608000000000001 | 0 | 0 | 0 |
| 0.609000000000001 | 0 | 0 | 0 |
| 0.610000000000001 | 0 | 0 | 0 |
| 0.611000000000001 | 0 | 0 | 0 |
| 0.612000000000001 | 0 | 0 | 0 |
| 0.613000000000001 | 0 | 0 | 0 |
| 0.614000000000001 | 0 | 0 | 0 |
| 0.615000000000001 | 0 | 0 | 0 |
| 0.616000000000001 | 0 | 0 | 0 |
| 0.617000000000001 | 0 | 0 | 0 |
| 0.618000000000001 | 0 | 0 | 0 |
| 0.619000000000001 | 0 | 0 | 0 |
| 0.620000000000001 | 0 | 0 | 0 |
| 0.621000000000001 | 0 | 0 | 0 |
| 0.622000000000001 | 0 | 0 | 0 |
| 0.623000000000001 | 0 | 0 | 0 |
| 0.624000000000001 | 0 | 0 | 0 |
| 0.625000000000001 | 0 | 0 | 0 |
| 0.626000000000001 | 0 | 0 | 0 |
| 0.627000000000001 | 0 | 0 | 0 |
| 0.628000000000001 | 0 | 0 | 0 |
| 0.629000000000001 | 0 | 0 | 0 |
| 0.630000000000001 | 0 | 0 | 0 |
| 0.631000000000001 | 0 | 0 | 0 |
| 0.632000000000001 | 0 | 0 | 0 |
| 0.633000000000001 | 0 | 0 | 0 |
| 0.634000000000001 | 0 | 0 | 0 |
| 0.635000000000001 | 0 | 0 | 0 |
| 0.636000000000001 | 0 | 0 | 0 |
| 0.637000000000001 | 0 | 0 | 0 |
| 0.638000000000001 | 0 | 0 | 0 |
| 0.639000000000001 | 0 | 0 | 0 |
| 0.640000000000001 | 0 | 0 | 0 |
| 0.641000000000001 | 0 | 0 | 0 |
| 0.642000000000001 | 0 | 0 | 0 |
| 0.643000000000001 | 0 | 0 | 0 |
| 0.644000000000001 | 0 | 0 | 0 |
| 0.645000000000001 | 0 | 0 | 0 |
| 0.646000000000001 | 0 | 0 | 0 |
| 0.647000000000001 | 0 | 0 | 0 |
| 0.648000000000001 | 0 | 0 | 0 |
| 0.649000000000001 | 0 | 0 | 0 |
| 0.650000000000001 | 0 | 0 | 0 |
| 0.651000000000001 | 0 | 0 | 0 |
| 0.652000000000001 | 0 | 0 | 0 |
| 0.653000000000001 | 0 | 0 | 0 |
| 0.654000000000001 | 0 | 0 | 0 |
| 0.655000000000001 | 0 | 0 | 0 |
| 0.656000000000001 | 0 | 0 | 0 |
| 0.657000000000001 | 0 | 0 | 0 |
| 0.658000000000001 | 0 | 0 | 0 |
| 0.659000000000001 | 0 | 0 | 0 |
| 0.660000000000001 | 0 | 0 | 0 |
| 0.661000000000001 | 0 | 0 | 0 |
| 0.662000000000001 | 0 | 0 | 0 |
| 0.663000000000001 | 0 | 0 | 0 |
| 0.664000000000001 | 0 | 0 | 0 |
| 0.665000000000001 | 0 | 0 | 0 |
| 0.666000000000001 | 0 | 0 | 0 |
| 0.667000000000001 | 0 | 0 | 0 |
| 0.668000000000001 | 0 | 0 | 0 |
| 0.669000000000001 | 0 | 0 | 0 |
| 0.670000000000001 | 0 | 0 | 0 |
| 0.671000000000001 | 0 | 0 | 0 |
| 0.672000000000001 | 0 | 0 | 0 |
| 0.673000000000001 | 0 | 0 | 0 |
| 0.674000000000001 | 0 | 0 | 0 |
| 0.675000000000001 | 0 | 0 | 0 |
| 0.676000000000001 | 0 | 0 | 0 |
| 0.677000000000001 | 0 | 0 | 0 |
| 0.678000000000001 | 0 | 0 | 0 |
| 0.679000000000001 | 0 | 0 | 0 |
| 0.680000000000001 | 0 | 0 | 0 |
| 0.681000000000001 | 0 | 0 | 0 |
| 0.682000000000001 | 0 | 0 | 0 |
| 0.683000000000001 | 0 | 0 | 0 |
| 0.684000000000001 | 0 | 0 | 0 |
| 0.685000000000001 | 0 | 0 | 0 |
| 0.686000000000001 | 0 | 0 | 0 |
| 0.687000000000001 | 0 | 0 | 0 |
| 0.688000000000001 | 0 | 0 | 0 |
| 0.689000000000001 | 0 | 0 | 0 |
| 0.690000000000001 | 0 | 0 | 0 |
| 0.691000000000001 | 0 | 0 | 0 |
| 0.692000000000001 | 0 | 0 | 0 |
| 0.693000000000001 | 0 | 0 | 0 |
| 0.694000000000001 | 0 | 0 | 0 |
| 0.695000000000001 | 0 | 0 | 0 |
| 0.696000000000001 | 0 | 0 | 0 |
| 0.697000000000001 | 0 | 0 | 0 |
| 0.698000000000001 | 0 | 0 | 0 |
| 0.699000000000001 | 0 | 0 | 0 |
| 0.700000000000001 | 0 | 0 | 0 |
| 0.701000000000001 | 0 | 0 | 0 |
| 0.702000000000001 | 0 | 0 | 0 |
| 0.703000000000001 | 0 | 0 | 0 |
| 0.704000000000001 | 0 | 0 | 0 |
| 0.705000000000001 | 0 | 0 | 0 |
| 0.706000000000001 | 0 | 0 | 0 |
| 0.707000000000001 | 0 | 0 | 0 |
| 0.708000000000001 | 0 | 0 | 0 |
| 0.709000000000001 | 0 | 0 | 0 |
| 0.710000000000001 | 0 | 0 | 0 |
| 0.711000000000001 | 0 | 0 | 0 |
| 0.712000000000001 | 0 | 0 | 0 |
| 0.713000000000001 | 0 | 0 | 0 |
| 0.714000000000001 | 0 | 0 | 0 |
| 0.715000000000001 | 0 | 0 | 0 |
| 0.716000000000001 | 0 | 0 | 0 |
| 0.717000000000001 | 0 | 0 | 0 |
| 0.718000000000001 | 0 | 0 | 0 |
| 0.719000000000001 | 0 | 0 | 0 |
| 0.720000000000001 | 0 | 0 | 0 |
| 0.721000000000001 | 0 | 0 | 0 |
| 0.722000000000001 | 0 | 0 | 0 |
| 0.723000000000001 | 0 | 0 | 0 |
| 0.724000000000001 | 0 | 0 | 0 |
| 0.725000000000001 | 0 | 0 | 0 |
| 0.726000000000001 | 0 | 0 | 0 |
| 0.727000000000001 | 0 | 0 | 0 |
| 0.728000000000001 | 0 | 0 | 0 |
| 0.729000000000001 | 0 | 0 | 0 |
| 0.730000000000001 | 0 | 0 | 0 |
| 0.731000000000001 | 0 | 0 | 0 |
| 0.732000000000001 | 0 | 0 | 0 |
| 0.733000000000001 | 0 | 0 | 0 |
| 0.734000000000001 | 0 | 0 | 0 |
| 0.735000000000001 | 0 | 0 | 0 |
| 0.736000000000001 | 0 | 0 | 0 |
| 0.737000000000001 | 0 | 0 | 0 |
| 0.738000000000001 | 0 | 0 | 0 |
| 0.739000000000001 | 0 | 0 | 0 |
| 0.740000000000001 | 0 | 0 | 0 |
| 0.741000000000001 | 0 | 0 | 0 |
| 0.742000000000001 | 0 | 0 | 0 |
| 0.743000000000001 | 0 | 0 | 0 |
| 0.744000000000001 | 0 | 0 | 0 |
| 0.745000000000001 | 0 | 0 | 0 |
| 0.746000000000001 | 0 | 0 | 0 |
| 0.747000000000001 | 0 | 0 | 0 |
| 0.748000000000001 | 0 | 0 | 0 |
| 0.749000000000001 | 0 | 0 | 0 |
| 0.750000000000001 | 0 | 0 | 0 |
| 0.751000000000001 | 0 | 0 | 0 |
| 0.752000000000001 | 0 | 0 | 0 |
| 0.753000000000001 | 0 | 0 | 0 |
| 0.754000000000001 | 0 | 0 | 0 |
| 0.755000000000001 | 0 | 0 | 0 |
| 0.756000000000001 | 0 | 0 | 0 |
| 0.757000000000001 | 0 | 0 | 0 |
| 0.758000000000001 | 0 | 0 | 0 |
| 0.759000000000001 | 0 | 0 | 0 |
| 0.760000000000001 | 0 | 0 | 0 |
| 0.761000000000001 | 0 | 0 | 0 |
| 0.762000000000001 | 0 | 0 | 0 |
| 0.763000000000001 | 0 | 0 | 0 |
| 0.764000000000001 | 0 | 0 | 0 |
| 0.765000000000001 | 0 | 0 | 0 |
| 0.766000000000001 | 0 | 0 | 0 |
| 0.767000000000001 | 0 | 0 | 0 |
| 0.768000000000001 | 0 | 0 | 0 |
| 0.769000000000001 | 0 | 0 | 0 |
| 0.770000000000001 | 0 | 0 | 0 |
| 0.771000000000001 | 0 | 0 | 0 |
| 0.772000000000001 | 0 | 0 | 0 |
| 0.773000000000001 | 0 | 0 | 0 |
| 0.774000000000001 | 0 | 0 | 0 |
| 0.775000000000001 | 0 | 0 | 0 |
| 0.776000000000001 | 0 | 0 | 0 |
| 0.777000000000001 | 0 | 0 | 0 |
| 0.778000000000001 | 0 | 0 | 0 |
| 0.779000000000001 | 0 | 0 | 0 |
| 0.780000000000001 | 0 | 0 | 0 |
| 0.781000000000001 | 0 | 0 | 0 |
| 0.782000000000001 | 0 | 0 | 0 |
| 0.783000000000001 | 0 | 0 | 0 |
| 0.784000000000001 | 0 | 0 | 0 |
| 0.785000000000001 | 0 | 0 | 0 |
| 0.786000000000001 | 0 | 0 | 0 |
| 0.787000000000001 | 0 | 0 | 0 |
| 0.788000000000001 | 0 | 0 | 0 |
| 0.789000000000001 | 0 | 0 | 0 |
| 0.790000000000001 | 0 | 0 | 0 |
| 0.791000000000001 | 0 | 0 | 0 |
| 0.792000000000001 | 0 | 0 | 0 |
| 0.793000000000001 | 0 | 0 | 0 |
| 0.794000000000001 | 0 | 0 | 0 |
| 0.795000000000001 | 0 | 0 | 0 |
| 0.796000000000001 | 0 | 0 | 0 |
| 0.797000000000001 | 0 | 0 | 0 |
| 0.798000000000001 | 0 | 0 | 0 |
| 0.799000000000001 | 0 | 0 | 0 |
| 0.800000000000001 | 0 | 0 | 0 |
| 0.801000000000001 | 0 | 0 | 0 |
| 0.802000000000001 | 0 | 0 | 0 |
| 0.803000000000001 | 0 | 0 | 0 |
| 0.804000000000001 | 0 | 0 | 0 |
| 0.805000000000001 | 0 | 0 | 0 |
| 0.806000000000001 | 0 | 0 | 0 |
| 0.807000000000001 | 0 | 0 | 0 |
| 0.808000000000001 | 0 | 0 | 0 |
| 0.809000000000001 | 0 | 0 | 0 |
| 0.810000000000001 | 0 | 0 | 0 |
| 0.811000000000001 | 0 | 0 | 0 |
| 0.812000000000001 | 0 | 0 | 0 |
| 0.813000000000001 | 0 | 0 | 0 |
| 0.814000000000001 | 0 | 0 | 0 |
| 0.815000000000001 | 0 | 0 | 0 |
| 0.816000000000001 | 0 | 0 | 0 |
| 0.817000000000001 | 0 | 0 | 0 |
| 0.818000000000001 | 0 | 0 | 0 |
| 0.819000000000001 | 0 | 0 | 0 |
| 0.820000000000001 | 0 | 0 | 0 |
| 0.821000000000001 | 0 | 0 | 0 |
| 0.822000000000001 | 0 | 0 | 0 |
| 0.823000000000001 | 0 | 0 | 0 |
| 0.824000000000001 | 0 | 0 | 0 |
| 0.825000000000001 | 0 | 0 | 0 |
| 0.826000000000001 | 0 | 0 | 0 |
| 0.827000000000001 | 0 | 0 | 0 |
| 0.828000000000001 | 0 | 0 | 0 |
| 0.829000000000001 | 0 | 0 | 0 |
| 0.830000000000001 | 0 | 0 | 0 |
| 0.831000000000001 | 0 | 0 | 0 |
| 0.832000000000001 | 0 | 0 | 0 |
| 0.833000000000001 | 0 | 0 | 0 |
| 0.834000000000001 | 0 | 0 | 0 |
| 0.835000000000001 | 0 | 0 | 0 |
| 0.836000000000001 | 0 | 0 | 0 |
| 0.837000000000001 | 0 | 0 | 0 |
| 0.838000000000001 | 0 | 0 | 0 |
| 0.839000000000001 | 0 | 0 | 0 |
| 0.840000000000001 | 0 | 0 | 0 |
| 0.841000000000001 | 0 | 0 | 0 |
| 0.842000000000001 | 0 | 0 | 0 |
| 0.843000000000001 | 0 | 0 | 0 |
| 0.844000000000001 | 0 | 0 | 0 |
| 0.845000000000001 | 0 | 0 | 0 |
| 0.846000000000001 | 0 | 0 | 0 |
| 0.847000000000001 | 0 | 0 | 0 |
| 0.848000000000001 | 0 | 0 | 0 |
| 0.849000000000001 | 0 | 0 | 0 |
| 0.850000000000001 | 0 | 0 | 0 |
| 0.851000000000001 | 0 | 0 | 0 |
| 0.852000000000001 | 0 | 0 | 0 |
| 0.853000000000001 | 0 | 0 | 0 |
| 0.854000000000001 | 0 | 0 | 0 |
| 0.855000000000001 | 0 | 0 | 0 |
| 0.856000000000001 | 0 | 0 | 0 |
| 0.857000000000001 | 0 | 0 | 0 |
| 0.858000000000001 | 0 | 0 | 0 |
| 0.859000000000001 | 0 | 0 | 0 |
| 0.860000000000001 | 0 | 0 | 0 |
| 0.861000000000001 | 0 | 0 | 0 |
| 0.862000000000001 | 0 | 0 | 0 |
| 0.863000000000001 | 0 | 0 | 0 |
| 0.864000000000001 | 0 | 0 | 0 |
| 0.865000000000001 | 0 | 0 | 0 |
| 0.866000000000001 | 0 | 0 | 0 |
| 0.867000000000001 | 0 | 0 | 0 |
| 0.868000000000001 | 0 | 0 | 0 |
| 0.869000000000001 | 0 | 0 | 0 |
| 0.870000000000001 | 0 | 0 | 0 |
| 0.871000000000001 | 0 | 0 | 0 |
| 0.872000000000001 | 0 | 0 | 0 |
| 0.873000000000001 | 0 | 0 | 0 |
| 0.874000000000001 | 0 | 0 | 0 |
| 0.875000000000001 | 0 | 0 | 0 |
| 0.876000000000001 | 0 | 0 | 0 |
| 0.877000000000001 | 0 | 0 | 0 |
| 0.878000000000001 | 0 | 0 | 0 |
| 0.879000000000001 | 0 | 0 | 0 |
| 0.880000000000001 | 0 | 0 | 0 |
| 0.881000000000001 | 0 | 0 | 0 |
| 0.882000000000001 | 0 | 0 | 0 |
| 0.883000000000001 | 0 | 0 | 0 |
| 0.884000000000001 | 0 | 0 | 0 |
| 0.885000000000001 | 0 | 0 | 0 |
| 0.886000000000001 | 0 | 0 | 0 |
| 0.887000000000001 | 0 | 0 | 0 |
| 0.888000000000001 | 0 | 0 | 0 |
| 0.889000000000001 | 0 | 0 | 0 |
| 0.890000000000001 | 0 | 0 | 0 |
| 0.891000000000001 | 0 | 0 | 0 |
| 0.892000000000001 | 0 | 0 | 0 |
| 0.893000000000001 | 0 | 0 | 0 |
| 0.894000000000001 | 0 | 0 | 0 |
| 0.895000000000001 | 0 | 0 | 0 |
| 0.896000000000001 | 0 | 0 | 0 |
| 0.897000000000001 | 0 | 0 | 0 |
| 0.898000000000001 | 0 | 0 | 0 |
| 0.899000000000001 | 0 | 0 | 0 |
| 0.900000000000001 | 0 | 0 | 0 |
| 0.901000000000001 | 0 | 0 | 0 |
| 0.902000000000001 | 0 | 0 | 0 |
| 0.903000000000001 | 0 | 0 | 0 |
| 0.904000000000001 | 0 | 0 | 0 |
| 0.905000000000001 | 0 | 0 | 0 |
| 0.906000000000001 | 0 | 0 | 0 |
| 0.907000000000001 | 0 | 0 | 0 |
| 0.908000000000001 | 0 | 0 | 0 |
| 0.909000000000001 | 0 | 0 | 0 |
| 0.910000000000001 | 0 | 0 | 0 |
| 0.911000000000001 | 0 | 0 | 0 |
| 0.912000000000001 | 0 | 0 | 0 |
| 0.913000000000001 | 0 | 0 | 0 |
| 0.914000000000001 | 0 | 0 | 0 |
| 0.915000000000001 | 0 | 0 | 0 |
| 0.916000000000001 | 0 | 0 | 0 |
| 0.917000000000001 | 0 | 0 | 0 |
| 0.918000000000001 | 0 | 0 | 0 |
| 0.919000000000001 | 0 | 0 | 0 |
| 0.920000000000001 | 0 | 0 | 0 |
| 0.921000000000001 | 0 | 0 | 0 |
| 0.922000000000001 | 0 | 0 | 0 |
| 0.923000000000001 | 0 | 0 | 0 |
| 0.924000000000001 | 0 | 0 | 0 |
| 0.925000000000001 | 0 | 0 | 0 |
| 0.926000000000001 | 0 | 0 | 0 |
| 0.927000000000001 | 0 | 0 | 0 |
| 0.928000000000001 | 0 | 0 | 0 |
| 0.929000000000001 | 0 | 0 | 0 |
| 0.930000000000001 | 0 | 0 | 0 |
| 0.931000000000001 | 0 | 0 | 0 |
| 0.932000000000001 | 0 | 0 | 0 |
| 0.933000000000001 | 0 | 0 | 0 |
| 0.934000000000001 | 0 | 0 | 0 |
| 0.935000000000001 | 0 | 0 | 0 |
| 0.936000000000001 | 0 | 0 | 0 |
| 0.937000000000001 | 0 | 0 | 0 |
| 0.938000000000001 | 0 | 0 | 0 |
| 0.939000000000001 | 0 | 0 | 0 |
| 0.940000000000001 | 0 | 0 | 0 |
| 0.941000000000001 | 0 | 0 | 0 |
| 0.942000000000001 | 0 | 0 | 0 |
| 0.943000000000001 | 0 | 0 | 0 |
| 0.944000000000001 | 0 | 0 | 0 |
| 0.945000000000001 | 0 | 0 | 0 |
| 0.946000000000001 | 0 | 0 | 0 |
| 0.947000000000001 | 0 | 0 | 0 |
| 0.948000000000001 | 0 | 0 | 0 |
| 0.949000000000001 | 0 | 0 | 0 |
| 0.950000000000001 | 0 | 0 | 0 |
| 0.951000000000001 | 0 | 0 | 0 |
| 0.952000000000001 | 0 | 0 | 0 |
| 0.953000000000001 | 0 | 0 | 0 |
| 0.954000000000001 | 0 | 0 | 0 |
| 0.955000000000001 | 0 | 0 | 0 |
| 0.956000000000001 | 0 | 0 | 0 |
| 0.957000000000001 | 0 | 0 | 0 |
| 0.958000000000001 | 0 | 0 | 0 |
| 0.959000000000001 | 0 | 0 | 0 |
| 0.960000000000001 | 0 | 0 | 0 |
| 0.961000000000001 | 0 | 0 | 0 |
| 0.962000000000001 | 0 | 0 | 0 |
| 0.963000000000001 | 0 | 0 | 0 |
| 0.964000000000001 | 0 | 0 | 0 |
| 0.965000000000001 | 0 | 0 | 0 |
| 0.966000000000001 | 0 | 0 | 0 |
| 0.967000000000001 | 0 | 0 | 0 |
| 0.968000000000001 | 0 | 0 | 0 |
| 0.969000000000001 | 0 | 0 | 0 |
| 0.970000000000001 | 0 | 0 | 0 |
| 0.971000000000001 | 0 | 0 | 0 |
| 0.972000000000001 | 0 | 0 | 0 |
| 0.973000000000001 | 0 | 0 | 0 |
| 0.974000000000001 | 0 | 0 | 0 |
| 0.975000000000001 | 0 | 0 | 0 |
| 0.976000000000001 | 0 | 0 | 0 |
| 0.977000000000001 | 0 | 0 | 0 |
| 0.978000000000001 | 0 | 0 | 0 |
| 0.979000000000001 | 0 | 0 | 0 |
| 0.980000000000001 | 0 | 0 | 0 |
| 0.981000000000001 | 0 | 0 | 0 |
| 0.982000000000001 | 0 | 0 | 0 |
| 0.983000000000001 | 0 | 0 | 0 |
| 0.984000000000001 | 0 | 0 | 0 |
| 0.985000000000001 | 0 | 0 | 0 |
| 0.986000000000001 | 0 | 0 | 0 |
| 0.987000000000001 | 0 | 0 | 0 |
| 0.988000000000001 | 0 | 0 | 0 |
| 0.989000000000001 | 0 | 0 | 0 |
| 0.990000000000001 | 0 | 0 | 0 |
| 0.991000000000001 | 0 | 0 | 0 |
| 0.992000000000001 | 0 | 0 | 0 |
| 0.993000000000001 | 0 | 0 | 0 |
| 0.994000000000001 | 0 | 0 | 0 |
| 0.995000000000001 | 0 | 0 | 0 |
| 0.996000000000001 | 0 | 0 | 0 |
| 0.997000000000001 | 0 | 0 | 0 |
| 0.998000000000001 | 0 | 0 | 0 |
| 0.999000000000001 | 0 | 0 | 0 |
| 1.000000000000001 | 0 | 0 | 0 |
| 1.001000000000001 | 0 | 0 | 0 |
| 1.002000000000001 | 0 | 0 | 0 |
| 1.003000000000001 | 0 | 0 | 0 |
| 1.004 | 0 | 0 | 0 |
| 1.005 | 0 | 0 | 0 |
| 1.006 | 0 | 0 | 0 |
| 1.007 | 0 | 0 | 0 |
| 1.008 | 0 | 0 | 0 |
| 1.009 | 0 | 0 | 0 |
| 1.01 | 0 | 0 | 0 |
| 1.011 | 0 | 0 | 0 |
| 1.012 | 0 | 0 | 0 |
| 1.012999999999999 | 0 | 0 | 0 |
| 1.013999999999999 | 0 | 0 | 0 |
| 1.014999999999999 | 0 | 0 | 0 |
| 1.015999999999999 | 0 | 0 | 0 |
| 1.016999999999999 | 0 | 0 | 0 |
| 1.017999999999999 | 0 | 0 | 0 |
| 1.018999999999999 | 0 | 0 | 0 |
| 1.019999999999999 | 0 | 0 | 0 |
| 1.020999999999999 | 0 | 0 | 0 |
| 1.021999999999998 | 0 | 0 | 0 |
| 1.022999999999998 | 0 | 0 | 0 |
| 1.023999999999998 | 0 | 0 | 0 |
| 1.024999999999998 | 0 | 0 | 0 |
| 1.025999999999998 | 0 | 0 | 0 |
| 1.026999999999998 | 0 | 0 | 0 |
| 1.027999999999998 | 0 | 0 | 0 |
| 1.028999999999998 | 0 | 0 | 0 |
| 1.029999999999998 | 0 | 0 | 0 |
| 1.030999999999997 | 0 | 0 | 0 |
| 1.031999999999997 | 0 | 0 | 0 |
| 1.032999999999997 | 0 | 0 | 0 |
| 1.033999999999997 | 0 | 0 | 0 |
| 1.034999999999997 | 0 | 0 | 0 |
| 1.035999999999997 | 0 | 0 | 0 |
| 1.036999999999997 | 0 | 0 | 0 |
| 1.037999999999997 | 0 | 0 | 0 |
| 1.038999999999997 | 0 | 0 | 0 |
| 1.039999999999996 | 0 | 0 | 0 |
| 1.040999999999996 | 0 | 0 | 0 |
| 1.041999999999996 | 0 | 0 | 0 |
| 1.042999999999996 | 0 | 0 | 0 |
| 1.043999999999996 | 0 | 0 | 0 |
| 1.044999999999996 | 0 | 0 | 0 |
| 1.045999999999996 | 0 | 0 | 0 |
| 1.046999999999996 | 0 | 0 | 0 |
| 1.047999999999996 | 0 | 0 | 0 |
| 1.048999999999995 | 0 | 0 | 0 |
| 1.049999999999995 | 0 | 0 | 0 |
| 1.050999999999995 | 0 | 0 | 0 |
| 1.051999999999995 | 0 | 0 | 0 |
| 1.052999999999995 | 0 | 0 | 0 |
| 1.053999999999995 | 0 | 0 | 0 |
| 1.054999999999995 | 0 | 0 | 0 |
| 1.055999999999995 | 0 | 0 | 0 |
| 1.056999999999995 | 0 | 0 | 0 |
| 1.057999999999994 | 0 | 0 | 0 |
| 1.058999999999994 | 0 | 0 | 0 |
| 1.059999999999994 | 0 | 0 | 0 |
| 1.060999999999994 | 0 | 0 | 0 |
| 1.061999999999994 | 0 | 0 | 0 |
| 1.062999999999994 | 0 | 0 | 0 |
| 1.063999999999994 | 0 | 0 | 0 |
| 1.064999999999994 | 0 | 0 | 0 |
| 1.065999999999994 | 0 | 0 | 0 |
| 1.066999999999993 | 0 | 0 | 0 |
| 1.067999999999993 | 0 | 0 | 0 |
| 1.068999999999993 | 0 | 0 | 0 |
| 1.069999999999993 | 0 | 0 | 0 |
| 1.070999999999993 | 0 | 0 | 0 |
| 1.071999999999993 | 0 | 0 | 0 |
| 1.072999999999993 | 0 | 0 | 0 |
| 1.073999999999993 | 0 | 0 | 0 |
| 1.074999999999993 | 0 | 0 | 0 |
| 1.075999999999993 | 0 | 0 | 0 |
| 1.076999999999992 | 0 | 0 | 0 |
| 1.077999999999992 | 0 | 0 | 0 |
| 1.078999999999992 | 0 | 0 | 0 |
| 1.079999999999992 | 0 | 0 | 0 |
| 1.080999999999992 | 0 | 0 | 0 |
| 1.081999999999992 | 0 | 0 | 0 |
| 1.082999999999992 | 0 | 0 | 0 |
| 1.083999999999992 | 0 | 0 | 0 |
| 1.084999999999992 | 0 | 0 | 0 |
| 1.085999999999991 | 0 | 0 | 0 |
| 1.086999999999991 | 0 | 0 | 0 |
| 1.087999999999991 | 0 | 0 | 0 |
| 1.088999999999991 | 0 | 0 | 0 |
| 1.089999999999991 | 0 | 0 | 0 |
| 1.090999999999991 | 0 | 0 | 0 |
| 1.091999999999991 | 0 | 0 | 0 |
| 1.092999999999991 | 0 | 0 | 0 |
| 1.093999999999991 | 0 | 0 | 0 |
| 1.09499999999999 | 0 | 0 | 0 |
| 1.09599999999999 | 0 | 0 | 0 |
| 1.09699999999999 | 0 | 0 | 0 |
| 1.09799999999999 | 0 | 0 | 0 |
| 1.09899999999999 | 0 | 0 | 0 |
| 1.09999999999999 | 0 | 0 | 0 |
| 1.10099999999999 | 0 | 0 | 0 |
| 1.10199999999999 | 0 | 0 | 0 |
| 1.10299999999999 | 0 | 0 | 0 |
| 1.103999999999989 | 0 | 0 | 0 |
| 1.104999999999989 | 0 | 0 | 0 |
| 1.105999999999989 | 0 | 0 | 0 |
| 1.106999999999989 | 0 | 0 | 0 |
| 1.107999999999989 | 0 | 0 | 0 |
| 1.108999999999989 | 0 | 0 | 0 |
| 1.109999999999989 | 0 | 0 | 0 |
| 1.110999999999989 | 0 | 0 | 0 |
| 1.111999999999989 | 0 | 0 | 0 |
| 1.112999999999988 | 0 | 0 | 0 |
| 1.113999999999988 | 0 | 0 | 0 |
| 1.114999999999988 | 0 | 0 | 0 |
| 1.115999999999988 | 0 | 0 | 0 |
| 1.116999999999988 | 0 | 0 | 0 |
| 1.117999999999988 | 0 | 0 | 0 |
| 1.118999999999988 | 0 | 0 | 0 |
| 1.119999999999988 | 0 | 0 | 0 |
| 1.120999999999988 | 0 | 0 | 0 |
| 1.121999999999987 | 0 | 0 | 0 |
| 1.122999999999987 | 0 | 0 | 0 |
| 1.123999999999987 | 0 | 0 | 0 |
| 1.124999999999987 | 0 | 0 | 0 |
| 1.125999999999987 | 0 | 0 | 0 |
| 1.126999999999987 | 0 | 0 | 0 |
| 1.127999999999987 | 0 | 0 | 0 |
| 1.128999999999987 | 0 | 0 | 0 |
| 1.129999999999987 | 0 | 0 | 0 |
| 1.130999999999986 | 0 | 0 | 0 |
| 1.131999999999986 | 0 | 0 | 0 |
| 1.132999999999986 | 0 | 0 | 0 |
| 1.133999999999986 | 0 | 0 | 0 |
| 1.134999999999986 | 0 | 0 | 0 |
| 1.135999999999986 | 0 | 0 | 0 |
| 1.136999999999986 | 0 | 0 | 0 |
| 1.137999999999986 | 0 | 0 | 0 |
| 1.138999999999986 | 0 | 0 | 0 |
| 1.139999999999985 | 0 | 0 | 0 |
| 1.140999999999985 | 0 | 0 | 0 |
| 1.141999999999985 | 0 | 0 | 0 |
| 1.142999999999985 | 0 | 0 | 0 |
| 1.143999999999985 | 0 | 0 | 0 |
| 1.144999999999985 | 0 | 0 | 0 |
| 1.145999999999985 | 0 | 0 | 0 |
| 1.146999999999985 | 0 | 0 | 0 |
| 1.147999999999985 | 0 | 0 | 0 |
| 1.148999999999984 | 0 | 0 | 0 |
| 1.149999999999984 | 0 | 0 | 0 |
| 1.150999999999984 | 0 | 0 | 0 |
| 1.151999999999984 | 0 | 0 | 0 |
| 1.152999999999984 | 0 | 0 | 0 |
| 1.153999999999984 | 0 | 0 | 0 |
| 1.154999999999984 | 0 | 0 | 0 |
| 1.155999999999984 | 0 | 0 | 0 |
| 1.156999999999984 | 0 | 0 | 0 |
| 1.157999999999983 | 0 | 0 | 0 |
| 1.158999999999983 | 0 | 0 | 0 |
| 1.159999999999983 | 0 | 0 | 0 |
| 1.160999999999983 | 0 | 0 | 0 |
| 1.161999999999983 | 0 | 0 | 0 |
| 1.162999999999983 | 0 | 0 | 0 |
| 1.163999999999983 | 0 | 0 | 0 |
| 1.164999999999983 | 0 | 0 | 0 |
| 1.165999999999983 | 0 | 0 | 0 |
| 1.166999999999982 | 0 | 0 | 0 |
| 1.167999999999982 | 0 | 0 | 0 |
| 1.168999999999982 | 0 | 0 | 0 |
| 1.169999999999982 | 0 | 0 | 0 |
| 1.170999999999982 | 0 | 0 | 0 |
| 1.171999999999982 | 0 | 0 | 0 |
| 1.172999999999982 | 0 | 0 | 0 |
| 1.173999999999982 | 0 | 0 | 0 |
| 1.174999999999982 | 0 | 0 | 0 |
| 1.175999999999981 | 0 | 0 | 0 |
| 1.176999999999981 | 0 | 0 | 0 |
| 1.177999999999981 | 0 | 0 | 0 |
| 1.178999999999981 | 0 | 0 | 0 |
| 1.179999999999981 | 0 | 0 | 0 |
| 1.180999999999981 | 0 | 0 | 0 |
| 1.181999999999981 | 0 | 0 | 0 |
| 1.182999999999981 | 0 | 0 | 0 |
| 1.183999999999981 | 0 | 0 | 0 |
| 1.18499999999998 | 0 | 0 | 0 |
| 1.18599999999998 | 0 | 0 | 0 |
| 1.18699999999998 | 0 | 0 | 0 |
| 1.18799999999998 | 0 | 0 | 0 |
| 1.18899999999998 | 0 | 0 | 0 |
| 1.18999999999998 | 0 | 0 | 0 |
| 1.19099999999998 | 0 | 0 | 0 |
| 1.19199999999998 | 0 | 0 | 0 |
| 1.19299999999998 | 0 | 0 | 0 |
| 1.193999999999979 | 0 | 0 | 0 |
| 1.194999999999979 | 0 | 0 | 0 |
| 1.195999999999979 | 0 | 0 | 0 |
| 1.196999999999979 | 0 | 0 | 0 |
| 1.197999999999979 | 0 | 0 | 0 |
| 1.198999999999979 | 0 | 0 | 0 |
| 1.199999999999979 | 0 | 0 | 0 |
| 1.200999999999979 | 0 | 0 | 0 |
| 1.201999999999979 | 0 | 0 | 0 |
| 1.202999999999979 | 0 | 0 | 0 |
| 1.203999999999978 | 0 | 0 | 0 |
| 1.204999999999978 | 0 | 0 | 0 |
| 1.205999999999978 | 0 | 0 | 0 |
| 1.206999999999978 | 0 | 0 | 0 |
| 1.207999999999978 | 0 | 0 | 0 |
| 1.208999999999978 | 0 | 0 | 0 |
| 1.209999999999978 | 0 | 0 | 0 |
| 1.210999999999978 | 0 | 0 | 0 |
| 1.211999999999978 | 0 | 0 | 0 |
| 1.212999999999977 | 0 | 0 | 0 |
| 1.213999999999977 | 0 | 0 | 0 |
| 1.214999999999977 | 0 | 0 | 0 |
| 1.215999999999977 | 0 | 0 | 0 |
| 1.216999999999977 | 0 | 0 | 0 |
| 1.217999999999977 | 0 | 0 | 0 |
| 1.218999999999977 | 0 | 0 | 0 |
| 1.219999999999977 | 0 | 0 | 0 |
| 1.220999999999977 | 0 | 0 | 0 |
| 1.221999999999976 | 0 | 0 | 0 |
| 1.222999999999976 | 0 | 0 | 0 |
| 1.223999999999976 | 0 | 0 | 0 |
| 1.224999999999976 | 0 | 0 | 0 |
| 1.225999999999976 | 0 | 0 | 0 |
| 1.226999999999976 | 0 | 0 | 0 |
| 1.227999999999976 | 0 | 0 | 0 |
| 1.228999999999976 | 0 | 0 | 0 |
| 1.229999999999976 | 0 | 0 | 0 |
| 1.230999999999975 | 0 | 0 | 0 |
| 1.231999999999975 | 0 | 0 | 0 |
| 1.232999999999975 | 0 | 0 | 0 |
| 1.233999999999975 | 0 | 0 | 0 |
| 1.234999999999975 | 0 | 0 | 0 |
| 1.235999999999975 | 0 | 0 | 0 |
| 1.236999999999975 | 0 | 0 | 0 |
| 1.237999999999975 | 0 | 0 | 0 |
| 1.238999999999975 | 0 | 0 | 0 |
| 1.239999999999974 | 0 | 0 | 0 |
| 1.240999999999974 | 0 | 0 | 0 |
| 1.241999999999974 | 0 | 0 | 0 |
| 1.242999999999974 | 0 | 0 | 0 |
| 1.243999999999974 | 0 | 0 | 0 |
| 1.244999999999974 | 0 | 0 | 0 |
| 1.245999999999974 | 0 | 0 | 0 |
| 1.246999999999974 | 0 | 0 | 0 |
| 1.247999999999974 | 0 | 0 | 0 |
| 1.248999999999973 | 0 | 0 | 0 |
| 1.249999999999973 | 0 | 0 | 0 |
| 1.250999999999973 | 0 | 0 | 0 |
| 1.251999999999973 | 0 | 0 | 0 |
| 1.252999999999973 | 0 | 0 | 0 |
| 1.253999999999973 | 0 | 0 | 0 |
| 1.254999999999973 | 0 | 0 | 0 |
| 1.255999999999973 | 0 | 0 | 0 |
| 1.256999999999973 | 0 | 0 | 0 |
| 1.257999999999972 | 0 | 0 | 0 |
| 1.258999999999972 | 0 | 0 | 0 |
| 1.259999999999972 | 0 | 0 | 0 |
| 1.260999999999972 | 0 | 0 | 0 |
| 1.261999999999972 | 0 | 0 | 0 |
| 1.262999999999972 | 0 | 0 | 0 |
| 1.263999999999972 | 0 | 0 | 0 |
| 1.264999999999972 | 0 | 0 | 0 |
| 1.265999999999972 | 0 | 0 | 0 |
| 1.266999999999971 | 0 | 0 | 0 |
| 1.267999999999971 | 0 | 0 | 0 |
| 1.268999999999971 | 0 | 0 | 0 |
| 1.269999999999971 | 0 | 0 | 0 |
| 1.270999999999971 | 0 | 0 | 0 |
| 1.271999999999971 | 0 | 0 | 0 |
| 1.272999999999971 | 0 | 0 | 0 |
| 1.273999999999971 | 0 | 0 | 0 |
| 1.274999999999971 | 0 | 0 | 0 |
| 1.27599999999997 | 0 | 0 | 0 |
| 1.27699999999997 | 0 | 0 | 0 |
| 1.27799999999997 | 0 | 0 | 0 |
| 1.27899999999997 | 0 | 0 | 0 |
| 1.27999999999997 | 0 | 0 | 0 |
| 1.28099999999997 | 0 | 0 | 0 |
| 1.28199999999997 | 0 | 0 | 0 |
| 1.28299999999997 | 0 | 0 | 0 |
| 1.28399999999997 | 0 | 0 | 0 |
| 1.284999999999969 | 0 | 0 | 0 |
| 1.285999999999969 | 0 | 0 | 0 |
| 1.286999999999969 | 0 | 0 | 0 |
| 1.287999999999969 | 0 | 0 | 0 |
| 1.288999999999969 | 0 | 0 | 0 |
| 1.289999999999969 | 0 | 0 | 0 |
| 1.290999999999969 | 0 | 0 | 0 |
| 1.291999999999969 | 0 | 0 | 0 |
| 1.292999999999969 | 0 | 0 | 0 |
| 1.293999999999968 | 0 | 0 | 0 |
| 1.294999999999968 | 0 | 0 | 0 |
| 1.295999999999968 | 0 | 0 | 0 |
| 1.296999999999968 | 0 | 0 | 0 |
| 1.297999999999968 | 0 | 0 | 0 |
| 1.298999999999968 | 0 | 0 | 0 |
| 1.299999999999968 | 0 | 0 | 0 |
| 1.300999999999968 | 0 | 0 | 0 |
| 1.301999999999968 | 0 | 0 | 0 |
| 1.302999999999967 | 0 | 0 | 0 |
| 1.303999999999967 | 0 | 0 | 0 |
| 1.304999999999967 | 0 | 0 | 0 |
| 1.305999999999967 | 0 | 0 | 0 |
| 1.306999999999967 | 0 | 0 | 0 |
| 1.307999999999967 | 0 | 0 | 0 |
| 1.308999999999967 | 0 | 0 | 0 |
| 1.309999999999967 | 0 | 0 | 0 |
| 1.310999999999967 | 0 | 0 | 0 |
| 1.311999999999966 | 0 | 0 | 0 |
| 1.312999999999966 | 0 | 0 | 0 |
| 1.313999999999966 | 0 | 0 | 0 |
| 1.314999999999966 | 0 | 0 | 0 |
| 1.315999999999966 | 0 | 0 | 0 |
| 1.316999999999966 | 0 | 0 | 0 |
| 1.317999999999966 | 0 | 0 | 0 |
| 1.318999999999966 | 0 | 0 | 0 |
| 1.319999999999966 | 0 | 0 | 0 |
| 1.320999999999965 | 0 | 0 | 0 |
| 1.321999999999965 | 0 | 0 | 0 |
| 1.322999999999965 | 0 | 0 | 0 |
| 1.323999999999965 | 0 | 0 | 0 |
| 1.324999999999965 | 0 | 0 | 0 |
| 1.325999999999965 | 0 | 0 | 0 |
| 1.326999999999965 | 0 | 0 | 0 |
| 1.327999999999965 | 0 | 0 | 0 |
| 1.328999999999965 | 0 | 0 | 0 |
| 1.329999999999964 | 0 | 0 | 0 |
| 1.330999999999964 | 0 | 0 | 0 |
| 1.331999999999964 | 0 | 0 | 0 |
| 1.332999999999964 | 0 | 0 | 0 |
| 1.333999999999964 | 0 | 0 | 0 |
| 1.334999999999964 | 0 | 0 | 0 |
| 1.335999999999964 | 0 | 0 | 0 |
| 1.336999999999964 | 0 | 0 | 0 |
| 1.337999999999964 | 0 | 0 | 0 |
| 1.338999999999964 | 0 | 0 | 0 |
| 1.339999999999963 | 0 | 0 | 0 |
| 1.340999999999963 | 0 | 0 | 0 |
| 1.341999999999963 | 0 | 0 | 0 |
| 1.342999999999963 | 0 | 0 | 0 |
| 1.343999999999963 | 0 | 0 | 0 |
| 1.344999999999963 | 0 | 0 | 0 |
| 1.345999999999963 | 0 | 0 | 0 |
| 1.346999999999963 | 0 | 0 | 0 |
| 1.347999999999963 | 0 | 0 | 0 |
| 1.348999999999962 | 0 | 0 | 0 |
| 1.349999999999962 | 0 | 0 | 0 |
| 1.350999999999962 | 0 | 0 | 0 |
| 1.351999999999962 | 0 | 0 | 0 |
| 1.352999999999962 | 0 | 0 | 0 |
| 1.353999999999962 | 0 | 0 | 0 |
| 1.354999999999962 | 0 | 0 | 0 |
| 1.355999999999962 | 0 | 0 | 0 |
| 1.356999999999962 | 0 | 0 | 0 |
| 1.357999999999961 | 0 | 0 | 0 |
| 1.358999999999961 | 0 | 0 | 0 |
| 1.359999999999961 | 0 | 0 | 0 |
| 1.360999999999961 | 0 | 0 | 0 |
| 1.361999999999961 | 0 | 0 | 0 |
| 1.362999999999961 | 0 | 0 | 0 |
| 1.363999999999961 | 0 | 0 | 0 |
| 1.364999999999961 | 0 | 0 | 0 |
| 1.365999999999961 | 0 | 0 | 0 |
| 1.36699999999996 | 0 | 0 | 0 |
| 1.36799999999996 | 0 | 0 | 0 |
| 1.36899999999996 | 0 | 0 | 0 |
| 1.36999999999996 | 0 | 0 | 0 |
| 1.37099999999996 | 0 | 0 | 0 |
| 1.37199999999996 | 0 | 0 | 0 |
| 1.37299999999996 | 0 | 0 | 0 |
| 1.37399999999996 | 0 | 0 | 0 |
| 1.37499999999996 | 0 | 0 | 0 |
| 1.375999999999959 | 0 | 0 | 0 |
| 1.376999999999959 | 0 | 0 | 0 |
| 1.377999999999959 | 0 | 0 | 0 |
| 1.378999999999959 | 0 | 0 | 0 |
| 1.379999999999959 | 0 | 0 | 0 |
| 1.380999999999959 | 0 | 0 | 0 |
| 1.381999999999959 | 0 | 0 | 0 |
| 1.382999999999959 | 0 | 0 | 0 |
| 1.383999999999959 | 0 | 0 | 0 |
| 1.384999999999958 | 0 | 0 | 0 |
| 1.385999999999958 | 0 | 0 | 0 |
| 1.386999999999958 | 0 | 0 | 0 |
| 1.387999999999958 | 0 | 0 | 0 |
| 1.388999999999958 | 0 | 0 | 0 |
| 1.389999999999958 | 0 | 0 | 0 |
| 1.390999999999958 | 0 | 0 | 0 |
| 1.391999999999958 | 0 | 0 | 0 |
| 1.392999999999958 | 0 | 0 | 0 |
| 1.393999999999957 | 0 | 0 | 0 |
| 1.394999999999957 | 0 | 0 | 0 |
| 1.395999999999957 | 0 | 0 | 0 |
| 1.396999999999957 | 0 | 0 | 0 |
| 1.397999999999957 | 0 | 0 | 0 |
| 1.398999999999957 | 0 | 0 | 0 |
| 1.399999999999957 | 0 | 0 | 0 |
| 1.400999999999957 | 0 | 0 | 0 |
| 1.401999999999957 | 0 | 0 | 0 |
| 1.402999999999956 | 0 | 0 | 0 |
| 1.403999999999956 | 0 | 0 | 0 |
| 1.404999999999956 | 0 | 0 | 0 |
| 1.405999999999956 | 0 | 0 | 0 |
| 1.406999999999956 | 0 | 0 | 0 |
| 1.407999999999956 | 0 | 0 | 0 |
| 1.408999999999956 | 0 | 0 | 0 |
| 1.409999999999956 | 0 | 0 | 0 |
| 1.410999999999956 | 0 | 0 | 0 |
| 1.411999999999955 | 0 | 0 | 0 |
| 1.412999999999955 | 0 | 0 | 0 |
| 1.413999999999955 | 0 | 0 | 0 |
| 1.414999999999955 | 0 | 0 | 0 |
| 1.415999999999955 | 0 | 0 | 0 |
| 1.416999999999955 | 0 | 0 | 0 |
| 1.417999999999955 | 0 | 0 | 0 |
| 1.418999999999955 | 0 | 0 | 0 |
| 1.419999999999955 | 0 | 0 | 0 |
| 1.420999999999954 | 0 | 0 | 0 |
| 1.421999999999954 | 0 | 0 | 0 |
| 1.422999999999954 | 0 | 0 | 0 |
| 1.423999999999954 | 0 | 0 | 0 |
| 1.424999999999954 | 0 | 0 | 0 |
| 1.425999999999954 | 0 | 0 | 0 |
| 1.426999999999954 | 0 | 0 | 0 |
| 1.427999999999954 | 0 | 0 | 0 |
| 1.428999999999954 | 0 | 0 | 0 |
| 1.429999999999954 | 0 | 0 | 0 |
| 1.430999999999953 | 0 | 0 | 0 |
| 1.431999999999953 | 0 | 0 | 0 |
| 1.432999999999953 | 0 | 0 | 0 |
| 1.433999999999953 | 0 | 0 | 0 |
| 1.434999999999953 | 0 | 0 | 0 |
| 1.435999999999953 | 0 | 0 | 0 |
| 1.436999999999953 | 0 | 0 | 0 |
| 1.437999999999953 | 0 | 0 | 0 |
| 1.438999999999953 | 0 | 0 | 0 |
| 1.439999999999952 | 0 | 0 | 0 |
| 1.440999999999952 | 0 | 0 | 0 |
| 1.441999999999952 | 0 | 0 | 0 |
| 1.442999999999952 | 0 | 0 | 0 |
| 1.443999999999952 | 0 | 0 | 0 |
| 1.444999999999952 | 0 | 0 | 0 |
| 1.445999999999952 | 0 | 0 | 0 |
| 1.446999999999952 | 0 | 0 | 0 |
| 1.447999999999952 | 0 | 0 | 0 |
| 1.448999999999951 | 0 | 0 | 0 |
| 1.449999999999951 | 0 | 0 | 0 |
| 1.450999999999951 | 0 | 0 | 0 |
| 1.451999999999951 | 0 | 0 | 0 |
| 1.452999999999951 | 0 | 0 | 0 |
| 1.453999999999951 | 0 | 0 | 0 |
| 1.454999999999951 | 0 | 0 | 0 |
| 1.455999999999951 | 0 | 0 | 0 |
| 1.456999999999951 | 0 | 0 | 0 |
| 1.45799999999995 | 0 | 0 | 0 |
| 1.45899999999995 | 0 | 0 | 0 |
| 1.45999999999995 | 0 | 0 | 0 |
| 1.46099999999995 | 0 | 0 | 0 |
| 1.46199999999995 | 0 | 0 | 0 |
| 1.46299999999995 | 0 | 0 | 0 |
| 1.46399999999995 | 0 | 0 | 0 |
| 1.46499999999995 | 0 | 0 | 0 |
| 1.46599999999995 | 0 | 0 | 0 |
| 1.466999999999949 | 0 | 0 | 0 |
| 1.467999999999949 | 0 | 0 | 0 |
| 1.468999999999949 | 0 | 0 | 0 |
| 1.469999999999949 | 0 | 0 | 0 |
| 1.470999999999949 | 0 | 0 | 0 |
| 1.471999999999949 | 0 | 0 | 0 |
| 1.472999999999949 | 0 | 0 | 0 |
| 1.473999999999949 | 0 | 0 | 0 |
| 1.474999999999949 | 0 | 0 | 0 |
| 1.475999999999948 | 0 | 0 | 0 |
| 1.476999999999948 | 0 | 0 | 0 |
| 1.477999999999948 | 0 | 0 | 0 |
| 1.478999999999948 | 0 | 0 | 0 |
| 1.479999999999948 | 0 | 0 | 0 |
| 1.480999999999948 | 0 | 0 | 0 |
| 1.481999999999948 | 0 | 0 | 0 |
| 1.482999999999948 | 0 | 0 | 0 |
| 1.483999999999948 | 0 | 0 | 0 |
| 1.484999999999947 | 0 | 0 | 0 |
| 1.485999999999947 | 0 | 0 | 0 |
| 1.486999999999947 | 0 | 0 | 0 |
| 1.487999999999947 | 0 | 0 | 0 |
| 1.488999999999947 | 0 | 0 | 0 |
| 1.489999999999947 | 0 | 0 | 0 |
| 1.490999999999947 | 0 | 0 | 0 |
| 1.491999999999947 | 0 | 0 | 0 |
| 1.492999999999947 | 0 | 0 | 0 |
| 1.493999999999946 | 0 | 0 | 0 |
| 1.494999999999946 | 0 | 0 | 0 |
| 1.495999999999946 | 0 | 0 | 0 |
| 1.496999999999946 | 0 | 0 | 0 |
| 1.497999999999946 | 0 | 0 | 0 |
| 1.498999999999946 | 0 | 0 | 0 |
| 1.499999999999946 | 0 | 0 | 0 |
| 1.500999999999946 | 0 | 0 | 0 |
| 1.501999999999946 | 0 | 0 | 0 |
| 1.502999999999945 | 0 | 0 | 0 |
| 1.503999999999945 | 0 | 0 | 0 |
| 1.504999999999945 | 0 | 0 | 0 |
| 1.505999999999945 | 0 | 0 | 0 |
| 1.506999999999945 | 0 | 0 | 0 |
| 1.507999999999945 | 0 | 0 | 0 |
| 1.508999999999945 | 0 | 0 | 0 |
| 1.509999999999945 | 0 | 0 | 0 |
| 1.510999999999945 | 0 | 0 | 0 |
| 1.511999999999944 | 0 | 0 | 0 |
| 1.512999999999944 | 0 | 0 | 0 |
| 1.513999999999944 | 0 | 0 | 0 |
| 1.514999999999944 | 0 | 0 | 0 |
| 1.515999999999944 | 0 | 0 | 0 |
| 1.516999999999944 | 0 | 0 | 0 |
| 1.517999999999944 | 0 | 0 | 0 |
| 1.518999999999944 | 0 | 0 | 0 |
| 1.519999999999944 | 0 | 0 | 0 |
| 1.520999999999944 | 0 | 0 | 0 |
| 1.521999999999943 | 0 | 0 | 0 |
| 1.522999999999943 | 0 | 0 | 0 |
| 1.523999999999943 | 0 | 0 | 0 |
| 1.524999999999943 | 0 | 0 | 0 |
| 1.525999999999943 | 0 | 0 | 0 |
| 1.526999999999943 | 0 | 0 | 0 |
| 1.527999999999943 | 0 | 0 | 0 |
| 1.528999999999943 | 0 | 0 | 0 |
| 1.529999999999943 | 0 | 0 | 0 |
| 1.530999999999942 | 0 | 0 | 0 |
| 1.531999999999942 | 0 | 0 | 0 |
| 1.532999999999942 | 0 | 0 | 0 |
| 1.533999999999942 | 0 | 0 | 0 |
| 1.534999999999942 | 0 | 0 | 0 |
| 1.535999999999942 | 0 | 0 | 0 |
| 1.536999999999942 | 0 | 0 | 0 |
| 1.537999999999942 | 0 | 0 | 0 |
| 1.538999999999942 | 0 | 0 | 0 |
| 1.539999999999941 | 0 | 0 | 0 |
| 1.540999999999941 | 0 | 0 | 0 |
| 1.541999999999941 | 0 | 0 | 0 |
| 1.542999999999941 | 0 | 0 | 0 |
| 1.543999999999941 | 0 | 0 | 0 |
| 1.544999999999941 | 0 | 0 | 0 |
| 1.545999999999941 | 0 | 0 | 0 |
| 1.546999999999941 | 0 | 0 | 0 |
| 1.547999999999941 | 0 | 0 | 0 |
| 1.54899999999994 | 0 | 0 | 0 |
| 1.54999999999994 | 0 | 0 | 0 |
| 1.55099999999994 | 0 | 0 | 0 |
| 1.55199999999994 | 0 | 0 | 0 |
| 1.55299999999994 | 0 | 0 | 0 |
| 1.55399999999994 | 0 | 0 | 0 |
| 1.55499999999994 | 0 | 0 | 0 |
| 1.55599999999994 | 0 | 0 | 0 |
| 1.55699999999994 | 0 | 0 | 0 |
| 1.557999999999939 | 0 | 0 | 0 |
| 1.558999999999939 | 0 | 0 | 0 |
| 1.559999999999939 | 0 | 0 | 0 |
| 1.560999999999939 | 0 | 0 | 0 |
| 1.561999999999939 | 0 | 0 | 0 |
| 1.562999999999939 | 0 | 0 | 0 |
| 1.563999999999939 | 0 | 0 | 0 |
| 1.564999999999939 | 0 | 0 | 0 |
| 1.565999999999939 | 0 | 0 | 0 |
| 1.566999999999938 | 0 | 0 | 0 |
| 1.567999999999938 | 0 | 0 | 0 |
| 1.568999999999938 | 0 | 0 | 0 |
| 1.569999999999938 | 0 | 0 | 0 |
| 1.570999999999938 | 0 | 0 | 0 |
| 1.571999999999938 | 0 | 0 | 0 |
| 1.572999999999938 | 0 | 0 | 0 |
| 1.573999999999938 | 0 | 0 | 0 |
| 1.574999999999938 | 0 | 0 | 0 |
| 1.575999999999937 | 0 | 0 | 0 |
| 1.576999999999937 | 0 | 0 | 0 |
| 1.577999999999937 | 0 | 0 | 0 |
| 1.578999999999937 | 0 | 0 | 0 |
| 1.579999999999937 | 0 | 0 | 0 |
| 1.580999999999937 | 0 | 0 | 0 |
| 1.581999999999937 | 0 | 0 | 0 |
| 1.582999999999937 | 0 | 0 | 0 |
| 1.583999999999937 | 0 | 0 | 0 |
| 1.584999999999936 | 0 | 0 | 0 |
| 1.585999999999936 | 0 | 0 | 0 |
| 1.586999999999936 | 0 | 0 | 0 |
| 1.587999999999936 | 0 | 0 | 0 |
| 1.588999999999936 | 0 | 0 | 0 |
| 1.589999999999936 | 0 | 0 | 0 |
| 1.590999999999936 | 0 | 0 | 0 |
| 1.591999999999936 | 0 | 0 | 0 |
| 1.592999999999936 | 0 | 0 | 0 |
| 1.593999999999935 | 0 | 0 | 0 |
| 1.594999999999935 | 0 | 0 | 0 |
| 1.595999999999935 | 0 | 0 | 0 |
| 1.596999999999935 | 0 | 0 | 0 |
| 1.597999999999935 | 0 | 0 | 0 |
| 1.598999999999935 | 0 | 0 | 0 |
| 1.599999999999935 | 0 | 0 | 0 |
| 1.600999999999935 | 0 | 0 | 0 |
| 1.601999999999934 | 0 | 0 | 0 |
| 1.602999999999934 | 0 | 0 | 0 |
| 1.603999999999934 | 0 | 0 | 0 |
| 1.604999999999934 | 0 | 0 | 0 |
| 1.605999999999934 | 0 | 0 | 0 |
| 1.606999999999934 | 0 | 0 | 0 |
| 1.607999999999934 | 0 | 0 | 0 |
| 1.608999999999934 | 0 | 0 | 0 |
| 1.609999999999934 | 0 | 0 | 0 |
| 1.610999999999934 | 0 | 0 | 0 |
| 1.611999999999933 | 0 | 0 | 0 |
| 1.612999999999933 | 0 | 0 | 0 |
| 1.613999999999933 | 0 | 0 | 0 |
| 1.614999999999933 | 0 | 0 | 0 |
| 1.615999999999933 | 0 | 0 | 0 |
| 1.616999999999933 | 0 | 0 | 0 |
| 1.617999999999933 | 0 | 0 | 0 |
| 1.618999999999933 | 0 | 0 | 0 |
| 1.619999999999933 | 0 | 0 | 0 |
| 1.620999999999932 | 0 | 0 | 0 |
| 1.621999999999932 | 0 | 0 | 0 |
| 1.622999999999932 | 0 | 0 | 0 |
| 1.623999999999932 | 0 | 0 | 0 |
| 1.624999999999932 | 0 | 0 | 0 |
| 1.625999999999932 | 0 | 0 | 0 |
| 1.626999999999932 | 0 | 0 | 0 |
| 1.627999999999932 | 0 | 0 | 0 |
| 1.628999999999932 | 0 | 0 | 0 |
| 1.629999999999931 | 0 | 0 | 0 |
| 1.630999999999931 | 0 | 0 | 0 |
| 1.631999999999931 | 0 | 0 | 0 |
| 1.632999999999931 | 0 | 0 | 0 |
| 1.633999999999931 | 0 | 0 | 0 |
| 1.634999999999931 | 0 | 0 | 0 |
| 1.635999999999931 | 0 | 0 | 0 |
| 1.636999999999931 | 0 | 0 | 0 |
| 1.637999999999931 | 0 | 0 | 0 |
| 1.63899999999993 | 0 | 0 | 0 |
| 1.63999999999993 | 0 | 0 | 0 |
| 1.64099999999993 | 0 | 0 | 0 |
| 1.64199999999993 | 0 | 0 | 0 |
| 1.64299999999993 | 0 | 0 | 0 |
| 1.64399999999993 | 0 | 0 | 0 |
| 1.64499999999993 | 0 | 0 | 0 |
| 1.64599999999993 | 0 | 0 | 0 |
| 1.64699999999993 | 0 | 0 | 0 |
| 1.647999999999929 | 0 | 0 | 0 |
| 1.648999999999929 | 0 | 0 | 0 |
| 1.649999999999929 | 0 | 0 | 0 |
| 1.650999999999929 | 0 | 0 | 0 |
| 1.651999999999929 | 0 | 0 | 0 |
| 1.652999999999929 | 0 | 0 | 0 |
| 1.653999999999929 | 0 | 0 | 0 |
| 1.654999999999929 | 0 | 0 | 0 |
| 1.655999999999929 | 0 | 0 | 0 |
| 1.656999999999928 | 0 | 0 | 0 |
| 1.657999999999928 | 0 | 0 | 0 |
| 1.658999999999928 | 0 | 0 | 0 |
| 1.659999999999928 | 0 | 0 | 0 |
| 1.660999999999928 | 0 | 0 | 0 |
| 1.661999999999928 | 0 | 0 | 0 |
| 1.662999999999928 | 0 | 0 | 0 |
| 1.663999999999928 | 0 | 0 | 0 |
| 1.664999999999928 | 0 | 0 | 0 |
| 1.665999999999927 | 0 | 0 | 0 |
| 1.666999999999927 | 0 | 0 | 0 |
| 1.667999999999927 | 0 | 0 | 0 |
| 1.668999999999927 | 0 | 0 | 0 |
| 1.669999999999927 | 0 | 0 | 0 |
| 1.670999999999927 | 0 | 0 | 0 |
| 1.671999999999927 | 0 | 0 | 0 |
| 1.672999999999927 | 0 | 0 | 0 |
| 1.673999999999927 | 0 | 0 | 0 |
| 1.674999999999926 | 0 | 0 | 0 |
| 1.675999999999926 | 0 | 0 | 0 |
| 1.676999999999926 | 0 | 0 | 0 |
| 1.677999999999926 | 0 | 0 | 0 |
| 1.678999999999926 | 0 | 0 | 0 |
| 1.679999999999926 | 0 | 0 | 0 |
| 1.680999999999926 | 0 | 0 | 0 |
| 1.681999999999926 | 0 | 0 | 0 |
| 1.682999999999926 | 0 | 0 | 0 |
| 1.683999999999925 | 0 | 0 | 0 |
| 1.684999999999925 | 0 | 0 | 0 |
| 1.685999999999925 | 0 | 0 | 0 |
| 1.686999999999925 | 0 | 0 | 0 |
| 1.687999999999925 | 0 | 0 | 0 |
| 1.688999999999925 | 0 | 0 | 0 |
| 1.689999999999925 | 0 | 0 | 0 |
| 1.690999999999925 | 0 | 0 | 0 |
| 1.691999999999925 | 0 | 0 | 0 |
| 1.692999999999924 | 0 | 0 | 0 |
| 1.693999999999924 | 0 | 0 | 0 |
| 1.694999999999924 | 0 | 0 | 0 |
| 1.695999999999924 | 0 | 0 | 0 |
| 1.696999999999924 | 0 | 0 | 0 |
| 1.697999999999924 | 0 | 0 | 0 |
| 1.698999999999924 | 0 | 0 | 0 |
| 1.699999999999924 | 0 | 0 | 0 |
| 1.700999999999924 | 0 | 0 | 0 |
| 1.701999999999924 | 0 | 0 | 0 |
| 1.702999999999923 | 0 | 0 | 0 |
| 1.703999999999923 | 0 | 0 | 0 |
| 1.704999999999923 | 0 | 0 | 0 |
| 1.705999999999923 | 0 | 0 | 0 |
| 1.706999999999923 | 0 | 0 | 0 |
| 1.707999999999923 | 0 | 0 | 0 |
| 1.708999999999923 | 0 | 0 | 0 |
| 1.709999999999923 | 0 | 0 | 0 |
| 1.710999999999923 | 0 | 0 | 0 |
| 1.711999999999922 | 0 | 0 | 0 |
| 1.712999999999922 | 0 | 0 | 0 |
| 1.713999999999922 | 0 | 0 | 0 |
| 1.714999999999922 | 0 | 0 | 0 |
| 1.715999999999922 | 0 | 0 | 0 |
| 1.716999999999922 | 0 | 0 | 0 |
| 1.717999999999922 | 0 | 0 | 0 |
| 1.718999999999922 | 0 | 0 | 0 |
| 1.719999999999922 | 0 | 0 | 0 |
| 1.720999999999921 | 0 | 0 | 0 |
| 1.721999999999921 | 0 | 0 | 0 |
| 1.722999999999921 | 0 | 0 | 0 |
| 1.723999999999921 | 0 | 0 | 0 |
| 1.724999999999921 | 0 | 0 | 0 |
| 1.725999999999921 | 0 | 0 | 0 |
| 1.726999999999921 | 0 | 0 | 0 |
| 1.727999999999921 | 0 | 0 | 0 |
| 1.728999999999921 | 0 | 0 | 0 |
| 1.72999999999992 | 0 | 0 | 0 |
| 1.73099999999992 | 0 | 0 | 0 |
| 1.73199999999992 | 0 | 0 | 0 |
| 1.73299999999992 | 0 | 0 | 0 |
| 1.73399999999992 | 0 | 0 | 0 |
| 1.73499999999992 | 0 | 0 | 0 |
| 1.73599999999992 | 0 | 0 | 0 |
| 1.73699999999992 | 0 | 0 | 0 |
| 1.73799999999992 | 0 | 0 | 0 |
| 1.738999999999919 | 0 | 0 | 0 |
| 1.739999999999919 | 0 | 0 | 0 |
| 1.740999999999919 | 0 | 0 | 0 |
| 1.741999999999919 | 0 | 0 | 0 |
| 1.742999999999919 | 0 | 0 | 0 |
| 1.743999999999919 | 0 | 0 | 0 |
| 1.744999999999919 | 0 | 0 | 0 |
| 1.745999999999919 | 0 | 0 | 0 |
| 1.746999999999919 | 0 | 0 | 0 |
| 1.747999999999918 | 0 | 0 | 0 |
| 1.748999999999918 | 0 | 0 | 0 |
| 1.749999999999918 | 0 | 0 | 0 |